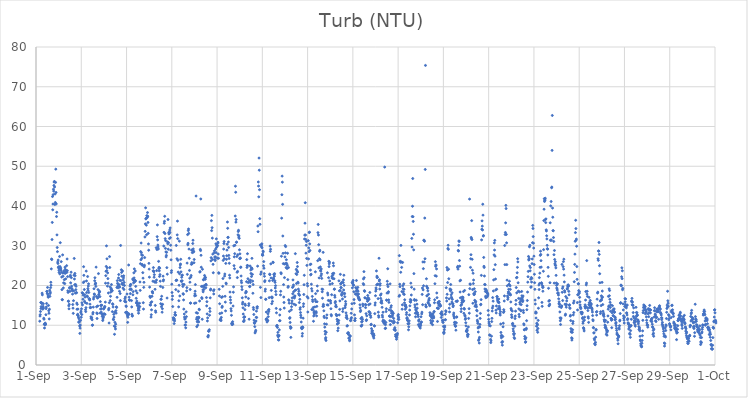
| Category | Turb (NTU) |
|---|---|
| 44440.166666666664 | 11.02 |
| 44440.177083333336 | 12.31 |
| 44440.1875 | 12.67 |
| 44440.197916666664 | 13.46 |
| 44440.208333333336 | 15.72 |
| 44440.21875 | 14.22 |
| 44440.229166666664 | 14.69 |
| 44440.239583333336 | 15.67 |
| 44440.25 | 15.5 |
| 44440.260416666664 | 15.59 |
| 44440.270833333336 | 18.06 |
| 44440.28125 | 17.65 |
| 44440.291666666664 | 14.39 |
| 44440.302083333336 | 14.05 |
| 44440.3125 | 14.75 |
| 44440.322916666664 | 15.4 |
| 44440.333333333336 | 14.33 |
| 44440.34375 | 11.76 |
| 44440.354166666664 | 11.52 |
| 44440.364583333336 | 10.25 |
| 44440.375 | 9.31 |
| 44440.385416666664 | 10.34 |
| 44440.395833333336 | 10.08 |
| 44440.40625 | 10.55 |
| 44440.416666666664 | 10.16 |
| 44440.427083333336 | 10.31 |
| 44440.4375 | 12.65 |
| 44440.447916666664 | 14.18 |
| 44440.458333333336 | 14.6 |
| 44440.46875 | 15.48 |
| 44440.479166666664 | 18.53 |
| 44440.489583333336 | 18.48 |
| 44440.5 | 18.03 |
| 44440.510416666664 | 19.52 |
| 44440.520833333336 | 17.82 |
| 44440.53125 | 17.36 |
| 44440.541666666664 | 17.05 |
| 44440.552083333336 | 14.99 |
| 44440.5625 | 13.65 |
| 44440.572916666664 | 13.01 |
| 44440.583333333336 | 11.59 |
| 44440.59375 | 14.04 |
| 44440.604166666664 | 18.81 |
| 44440.614583333336 | 17.27 |
| 44440.625 | 17.96 |
| 44440.635416666664 | 18.32 |
| 44440.645833333336 | 19.47 |
| 44440.65625 | 20.81 |
| 44440.666666666664 | 20.08 |
| 44440.677083333336 | 24.18 |
| 44440.6875 | 26.66 |
| 44440.697916666664 | 26.53 |
| 44440.708333333336 | 31.56 |
| 44440.71875 | 35.87 |
| 44440.729166666664 | 42.38 |
| 44440.739583333336 | 39.04 |
| 44440.75 | 40.49 |
| 44440.760416666664 | 42.86 |
| 44440.770833333336 | 44.22 |
| 44440.78125 | 43.75 |
| 44440.791666666664 | 45.17 |
| 44440.802083333336 | 46.01 |
| 44440.8125 | 46.17 |
| 44440.822916666664 | 44.79 |
| 44440.833333333336 | 40.37 |
| 44440.84375 | 43.02 |
| 44440.854166666664 | 40.89 |
| 44440.864583333336 | 45.94 |
| 44440.875 | 49.27 |
| 44440.885416666664 | 43.41 |
| 44440.895833333336 | 40.53 |
| 44440.90625 | 37.35 |
| 44440.916666666664 | 38.42 |
| 44440.927083333336 | 32.73 |
| 44440.9375 | 29.55 |
| 44440.947916666664 | 28.52 |
| 44440.958333333336 | 25.89 |
| 44440.96875 | 25.54 |
| 44440.979166666664 | 26.4 |
| 44440.989583333336 | 24.51 |
| 44441.0 | 24.71 |
| 44441.010416666664 | 23.85 |
| 44441.020833333336 | 23.3 |
| 44441.03125 | 24.33 |
| 44441.041666666664 | 27.3 |
| 44441.052083333336 | 22.92 |
| 44441.0625 | 24.76 |
| 44441.072916666664 | 30.77 |
| 44441.083333333336 | 24.45 |
| 44441.09375 | 24.19 |
| 44441.104166666664 | 23.85 |
| 44441.114583333336 | 26 |
| 44441.125 | 23.36 |
| 44441.135416666664 | 22.13 |
| 44441.145833333336 | 18.97 |
| 44441.15625 | 16.43 |
| 44441.166666666664 | 16.44 |
| 44441.177083333336 | 27.7 |
| 44441.1875 | 23.11 |
| 44441.197916666664 | 22.33 |
| 44441.208333333336 | 19.39 |
| 44441.21875 | 20.66 |
| 44441.229166666664 | 23.64 |
| 44441.239583333336 | 23.37 |
| 44441.25 | 21.47 |
| 44441.260416666664 | 23.13 |
| 44441.270833333336 | 20.48 |
| 44441.28125 | 24.62 |
| 44441.291666666664 | 24.08 |
| 44441.302083333336 | 23.08 |
| 44441.3125 | 21.67 |
| 44441.322916666664 | 23.81 |
| 44441.333333333336 | 23.59 |
| 44441.34375 | 23.65 |
| 44441.354166666664 | 24.99 |
| 44441.364583333336 | 23.3 |
| 44441.375 | 26.67 |
| 44441.385416666664 | 23.73 |
| 44441.395833333336 | 22.24 |
| 44441.40625 | 18.66 |
| 44441.416666666664 | 18.26 |
| 44441.427083333336 | 16.05 |
| 44441.4375 | 16.03 |
| 44441.447916666664 | 14.89 |
| 44441.458333333336 | 14.13 |
| 44441.46875 | 15.27 |
| 44441.479166666664 | 19.47 |
| 44441.489583333336 | 19.32 |
| 44441.5 | 18.52 |
| 44441.510416666664 | 22.25 |
| 44441.520833333336 | 22.56 |
| 44441.53125 | 20.67 |
| 44441.541666666664 | 618.38 |
| 44441.552083333336 | 23.35 |
| 44441.5625 | 21.97 |
| 44441.572916666664 | 19.82 |
| 44441.583333333336 | 19.25 |
| 44441.59375 | 19.03 |
| 44441.604166666664 | 18.67 |
| 44441.614583333336 | 17.83 |
| 44441.625 | 15.21 |
| 44441.635416666664 | 14.3 |
| 44441.645833333336 | 12.99 |
| 44441.65625 | 16.18 |
| 44441.666666666664 | 18.65 |
| 44441.677083333336 | 22.59 |
| 44441.6875 | 26.81 |
| 44441.697916666664 | 21.63 |
| 44441.708333333336 | 20.18 |
| 44441.71875 | 23.03 |
| 44441.729166666664 | 22.46 |
| 44441.739583333336 | 18.08 |
| 44441.75 | 20.25 |
| 44441.760416666664 | 18.96 |
| 44441.770833333336 | 19.81 |
| 44441.78125 | 18.18 |
| 44441.791666666664 | 18.2 |
| 44441.802083333336 | 15.57 |
| 44441.8125 | 14.03 |
| 44441.822916666664 | 15.25 |
| 44441.833333333336 | 12.59 |
| 44441.84375 | 12.76 |
| 44441.854166666664 | 14.07 |
| 44441.864583333336 | 12.42 |
| 44441.875 | 12.04 |
| 44441.885416666664 | 10.75 |
| 44441.895833333336 | 11.65 |
| 44441.90625 | 10.93 |
| 44441.916666666664 | 10.81 |
| 44441.927083333336 | 9.82 |
| 44441.9375 | 7.95 |
| 44441.947916666664 | 9.27 |
| 44441.958333333336 | 10.04 |
| 44441.96875 | 11.23 |
| 44441.979166666664 | 13.15 |
| 44441.989583333336 | 13.54 |
| 44442.0 | 12.02 |
| 44442.010416666664 | 14.13 |
| 44442.020833333336 | 12.7 |
| 44442.03125 | 15.64 |
| 44442.041666666664 | 18.18 |
| 44442.052083333336 | 15.12 |
| 44442.0625 | 18.08 |
| 44442.072916666664 | 16.55 |
| 44442.083333333336 | 17.56 |
| 44442.09375 | 20.74 |
| 44442.104166666664 | 24.73 |
| 44442.114583333336 | 22.56 |
| 44442.125 | 20.95 |
| 44442.135416666664 | 18.99 |
| 44442.145833333336 | 16.03 |
| 44442.15625 | 17.7 |
| 44442.166666666664 | 17.08 |
| 44442.177083333336 | 15.69 |
| 44442.1875 | 13.91 |
| 44442.197916666664 | 13.43 |
| 44442.208333333336 | 14.42 |
| 44442.21875 | 23.62 |
| 44442.229166666664 | 21.14 |
| 44442.239583333336 | 18.24 |
| 44442.25 | 15.5 |
| 44442.260416666664 | 17.35 |
| 44442.270833333336 | 17.22 |
| 44442.28125 | 22.26 |
| 44442.291666666664 | 19.23 |
| 44442.302083333336 | 18.79 |
| 44442.3125 | 19.86 |
| 44442.322916666664 | 20.42 |
| 44442.333333333336 | 18.25 |
| 44442.34375 | 16.62 |
| 44442.354166666664 | 16.71 |
| 44442.364583333336 | 16.56 |
| 44442.375 | 16.34 |
| 44442.385416666664 | 15.31 |
| 44442.395833333336 | 14.43 |
| 44442.40625 | 14.48 |
| 44442.416666666664 | 14.46 |
| 44442.427083333336 | 12.12 |
| 44442.4375 | 11.74 |
| 44442.447916666664 | 11.81 |
| 44442.458333333336 | 11.93 |
| 44442.46875 | 495.26 |
| 44442.479166666664 | 11.38 |
| 44442.489583333336 | 9.98 |
| 44442.5 | 10.06 |
| 44442.510416666664 | 12.84 |
| 44442.520833333336 | 13.21 |
| 44442.53125 | 14.56 |
| 44442.541666666664 | 16.6 |
| 44442.552083333336 | 17.07 |
| 44442.5625 | 19.18 |
| 44442.572916666664 | 17.87 |
| 44442.583333333336 | 17.74 |
| 44442.59375 | 21.19 |
| 44442.604166666664 | 21.96 |
| 44442.614583333336 | 20.32 |
| 44442.625 | 20.47 |
| 44442.635416666664 | 20.58 |
| 44442.645833333336 | 19.77 |
| 44442.65625 | 24.62 |
| 44442.666666666664 | 17.24 |
| 44442.677083333336 | 14.65 |
| 44442.6875 | 13.09 |
| 44442.697916666664 | 11.7 |
| 44442.708333333336 | 12.93 |
| 44442.71875 | 16.82 |
| 44442.729166666664 | 14.85 |
| 44442.739583333336 | 18.96 |
| 44442.75 | 17.09 |
| 44442.760416666664 | 22.99 |
| 44442.770833333336 | 17.63 |
| 44442.78125 | 17.81 |
| 44442.791666666664 | 18.36 |
| 44442.802083333336 | 18.56 |
| 44442.8125 | 18.41 |
| 44442.822916666664 | 17.21 |
| 44442.833333333336 | 13.07 |
| 44442.84375 | 15.95 |
| 44442.854166666664 | 14.09 |
| 44442.864583333336 | 14.96 |
| 44442.875 | 15.02 |
| 44442.885416666664 | 13.3 |
| 44442.895833333336 | 14.18 |
| 44442.90625 | 15.04 |
| 44442.916666666664 | 12.82 |
| 44442.927083333336 | 12.25 |
| 44442.9375 | 12.72 |
| 44442.947916666664 | 11.19 |
| 44442.958333333336 | 11.59 |
| 44442.96875 | 11.92 |
| 44442.979166666664 | 12.16 |
| 44442.989583333336 | 14.09 |
| 44443.0 | 12.73 |
| 44443.010416666664 | 12.91 |
| 44443.020833333336 | 14.35 |
| 44443.03125 | 14.55 |
| 44443.041666666664 | 14.72 |
| 44443.052083333336 | 12.74 |
| 44443.0625 | 15.82 |
| 44443.072916666664 | 20.58 |
| 44443.083333333336 | 22.47 |
| 44443.09375 | 23.57 |
| 44443.104166666664 | 24.8 |
| 44443.114583333336 | 29.97 |
| 44443.125 | 23.74 |
| 44443.135416666664 | 26.71 |
| 44443.145833333336 | 24.43 |
| 44443.15625 | 19.84 |
| 44443.166666666664 | 23.17 |
| 44443.177083333336 | 21.74 |
| 44443.1875 | 20.58 |
| 44443.197916666664 | 18.12 |
| 44443.208333333336 | 13.88 |
| 44443.21875 | 14.24 |
| 44443.229166666664 | 10.56 |
| 44443.239583333336 | 15.67 |
| 44443.25 | 27.27 |
| 44443.260416666664 | 24.52 |
| 44443.270833333336 | 19.64 |
| 44443.28125 | 16.21 |
| 44443.291666666664 | 17.28 |
| 44443.302083333336 | 18.33 |
| 44443.3125 | 19.05 |
| 44443.322916666664 | 19.29 |
| 44443.333333333336 | 20.24 |
| 44443.34375 | 18.72 |
| 44443.354166666664 | 18.77 |
| 44443.364583333336 | 18.64 |
| 44443.375 | 13.42 |
| 44443.385416666664 | 15.41 |
| 44443.395833333336 | 15.24 |
| 44443.40625 | 14.59 |
| 44443.416666666664 | 11.52 |
| 44443.427083333336 | 11.38 |
| 44443.4375 | 12.74 |
| 44443.447916666664 | 12.04 |
| 44443.458333333336 | 9.79 |
| 44443.46875 | 7.72 |
| 44443.479166666664 | 13.27 |
| 44443.489583333336 | 10.72 |
| 44443.5 | 9.61 |
| 44443.510416666664 | 9.07 |
| 44443.520833333336 | 10.27 |
| 44443.53125 | 13.67 |
| 44443.541666666664 | 13.06 |
| 44443.552083333336 | 14.63 |
| 44443.5625 | 14.47 |
| 44443.572916666664 | 19.52 |
| 44443.583333333336 | 17.03 |
| 44443.59375 | 21.22 |
| 44443.604166666664 | 20.55 |
| 44443.614583333336 | 19.82 |
| 44443.625 | 19.4 |
| 44443.635416666664 | 20.25 |
| 44443.645833333336 | 21.88 |
| 44443.65625 | 22.76 |
| 44443.666666666664 | 19.65 |
| 44443.677083333336 | 20.18 |
| 44443.6875 | 18.54 |
| 44443.697916666664 | 19.62 |
| 44443.708333333336 | 21.29 |
| 44443.71875 | 17.98 |
| 44443.729166666664 | 16.21 |
| 44443.739583333336 | 30.07 |
| 44443.75 | 21.25 |
| 44443.760416666664 | 437.46 |
| 44443.770833333336 | 23.96 |
| 44443.78125 | 23.29 |
| 44443.791666666664 | 22.34 |
| 44443.802083333336 | 20.43 |
| 44443.8125 | 20.57 |
| 44443.822916666664 | 23.65 |
| 44443.833333333336 | 20.23 |
| 44443.84375 | 19.36 |
| 44443.854166666664 | 21.36 |
| 44443.864583333336 | 21.91 |
| 44443.875 | 22.43 |
| 44443.885416666664 | 19.01 |
| 44443.895833333336 | 20.77 |
| 44443.90625 | 20.01 |
| 44443.916666666664 | 16.07 |
| 44443.927083333336 | 16.66 |
| 44443.9375 | 15.95 |
| 44443.947916666664 | 17.09 |
| 44443.958333333336 | 13.22 |
| 44443.96875 | 15.88 |
| 44443.979166666664 | 14.87 |
| 44443.989583333336 | 14.71 |
| 44444.0 | 13.25 |
| 44444.010416666664 | 13.27 |
| 44444.020833333336 | 17.85 |
| 44444.03125 | 12.71 |
| 44444.041666666664 | 12.35 |
| 44444.052083333336 | 10.73 |
| 44444.0625 | 12 |
| 44444.072916666664 | 12.75 |
| 44444.083333333336 | 12.96 |
| 44444.09375 | 25.15 |
| 44444.104166666664 | 12.72 |
| 44444.114583333336 | 17.05 |
| 44444.125 | 16.38 |
| 44444.135416666664 | 16.3 |
| 44444.145833333336 | 19.03 |
| 44444.15625 | 19.84 |
| 44444.166666666664 | 17.96 |
| 44444.177083333336 | 20.23 |
| 44444.1875 | 20.26 |
| 44444.197916666664 | 19.13 |
| 44444.208333333336 | 18.98 |
| 44444.21875 | 16.2 |
| 44444.229166666664 | 14.61 |
| 44444.239583333336 | 12.78 |
| 44444.25 | 12.31 |
| 44444.260416666664 | 12.37 |
| 44444.270833333336 | 21.62 |
| 44444.28125 | 17.66 |
| 44444.291666666664 | 18.46 |
| 44444.302083333336 | 21.31 |
| 44444.3125 | 20.66 |
| 44444.322916666664 | 23.18 |
| 44444.333333333336 | 21.91 |
| 44444.34375 | 24.18 |
| 44444.354166666664 | 21.04 |
| 44444.364583333336 | 21.32 |
| 44444.375 | 20.99 |
| 44444.385416666664 | 23.65 |
| 44444.395833333336 | 21.19 |
| 44444.40625 | 19.78 |
| 44444.416666666664 | 18.66 |
| 44444.427083333336 | 16.78 |
| 44444.4375 | 15.64 |
| 44444.447916666664 | 15.58 |
| 44444.458333333336 | 16.07 |
| 44444.46875 | 18.12 |
| 44444.479166666664 | 14.94 |
| 44444.489583333336 | 15.09 |
| 44444.5 | 15.5 |
| 44444.510416666664 | 13.75 |
| 44444.520833333336 | 14.32 |
| 44444.53125 | 13.04 |
| 44444.541666666664 | 14.24 |
| 44444.552083333336 | 13.77 |
| 44444.5625 | 14.7 |
| 44444.572916666664 | 15.52 |
| 44444.583333333336 | 14.69 |
| 44444.59375 | 20.88 |
| 44444.604166666664 | 18.77 |
| 44444.614583333336 | 25.49 |
| 44444.625 | 28.53 |
| 44444.635416666664 | 26.47 |
| 44444.645833333336 | 30.69 |
| 44444.65625 | 28.25 |
| 44444.666666666664 | 27.69 |
| 44444.677083333336 | 26.83 |
| 44444.6875 | 25.31 |
| 44444.697916666664 | 25.07 |
| 44444.708333333336 | 27.58 |
| 44444.71875 | 23.23 |
| 44444.729166666664 | 21.85 |
| 44444.739583333336 | 15.67 |
| 44444.75 | 14.07 |
| 44444.760416666664 | 19.53 |
| 44444.770833333336 | 20.8 |
| 44444.78125 | 24.71 |
| 44444.791666666664 | 25.1 |
| 44444.802083333336 | 27.03 |
| 44444.8125 | 32.21 |
| 44444.822916666664 | 33.62 |
| 44444.833333333336 | 35.5 |
| 44444.84375 | 39.54 |
| 44444.854166666664 | 36.75 |
| 44444.864583333336 | 36.86 |
| 44444.875 | 35.18 |
| 44444.885416666664 | 32.77 |
| 44444.895833333336 | 37.57 |
| 44444.90625 | 37.06 |
| 44444.916666666664 | 37.2 |
| 44444.927083333336 | 38.35 |
| 44444.9375 | 37.44 |
| 44444.947916666664 | 35.86 |
| 44444.958333333336 | 33.12 |
| 44444.96875 | 30.46 |
| 44444.979166666664 | 28.88 |
| 44444.989583333336 | 25.57 |
| 44445.0 | 24.12 |
| 44445.010416666664 | 22.1 |
| 44445.020833333336 | 19.59 |
| 44445.03125 | 17.28 |
| 44445.041666666664 | 15.12 |
| 44445.052083333336 | 16.99 |
| 44445.0625 | 15.07 |
| 44445.072916666664 | 15.66 |
| 44445.083333333336 | 12.05 |
| 44445.09375 | 12.65 |
| 44445.104166666664 | 13.88 |
| 44445.114583333336 | 15.9 |
| 44445.125 | 17.28 |
| 44445.135416666664 | 18.4 |
| 44445.145833333336 | 18.46 |
| 44445.15625 | 18.1 |
| 44445.166666666664 | 21.08 |
| 44445.177083333336 | 23.69 |
| 44445.1875 | 24.51 |
| 44445.197916666664 | 23.6 |
| 44445.208333333336 | 23.45 |
| 44445.21875 | 22.08 |
| 44445.229166666664 | 22.73 |
| 44445.239583333336 | 20.9 |
| 44445.25 | 20.93 |
| 44445.260416666664 | 19.05 |
| 44445.270833333336 | 14.99 |
| 44445.28125 | 13.62 |
| 44445.291666666664 | 13.27 |
| 44445.302083333336 | 20.78 |
| 44445.3125 | 29.51 |
| 44445.322916666664 | 21.37 |
| 44445.333333333336 | 23.75 |
| 44445.34375 | 29.05 |
| 44445.354166666664 | 32.29 |
| 44445.364583333336 | 35.24 |
| 44445.375 | 31.47 |
| 44445.385416666664 | 30.17 |
| 44445.395833333336 | 29.69 |
| 44445.40625 | 29.19 |
| 44445.416666666664 | 26.07 |
| 44445.427083333336 | 24.27 |
| 44445.4375 | 24.57 |
| 44445.447916666664 | 23.69 |
| 44445.458333333336 | 22.28 |
| 44445.46875 | 24.38 |
| 44445.479166666664 | 22.74 |
| 44445.489583333336 | 21.09 |
| 44445.5 | 19.78 |
| 44445.510416666664 | 15.42 |
| 44445.520833333336 | 16.55 |
| 44445.53125 | 16.52 |
| 44445.541666666664 | 14.66 |
| 44445.552083333336 | 17.29 |
| 44445.5625 | 15.17 |
| 44445.572916666664 | 13.28 |
| 44445.583333333336 | 14.16 |
| 44445.59375 | 15.27 |
| 44445.604166666664 | 19.51 |
| 44445.614583333336 | 22.35 |
| 44445.625 | 21.15 |
| 44445.635416666664 | 21.43 |
| 44445.645833333336 | 29.94 |
| 44445.65625 | 33.38 |
| 44445.666666666664 | 35.67 |
| 44445.677083333336 | 36.15 |
| 44445.6875 | 37.41 |
| 44445.697916666664 | 33.07 |
| 44445.708333333336 | 31.79 |
| 44445.71875 | 29.34 |
| 44445.729166666664 | 31.29 |
| 44445.739583333336 | 28.45 |
| 44445.75 | 27.2 |
| 44445.760416666664 | 27.58 |
| 44445.770833333336 | 28.35 |
| 44445.78125 | 24.49 |
| 44445.791666666664 | 16.85 |
| 44445.802083333336 | 22.85 |
| 44445.8125 | 30.95 |
| 44445.822916666664 | 30.5 |
| 44445.833333333336 | 36.6 |
| 44445.84375 | 29.13 |
| 44445.854166666664 | 30.78 |
| 44445.864583333336 | 33.36 |
| 44445.875 | 32.96 |
| 44445.885416666664 | 33.12 |
| 44445.895833333336 | 31.83 |
| 44445.90625 | 33.96 |
| 44445.916666666664 | 33.37 |
| 44445.927083333336 | 34.48 |
| 44445.9375 | 32.03 |
| 44445.947916666664 | 30.13 |
| 44445.958333333336 | 28.87 |
| 44445.96875 | 26.46 |
| 44445.979166666664 | 23.26 |
| 44445.989583333336 | 23.74 |
| 44446.0 | 20.32 |
| 44446.010416666664 | 18.23 |
| 44446.020833333336 | 16.5 |
| 44446.03125 | 17.35 |
| 44446.041666666664 | 14.7 |
| 44446.052083333336 | 214.89 |
| 44446.0625 | 11.87 |
| 44446.072916666664 | 11.34 |
| 44446.083333333336 | 11.8 |
| 44446.09375 | 11.55 |
| 44446.104166666664 | 10.42 |
| 44446.114583333336 | 11.56 |
| 44446.125 | 11.09 |
| 44446.135416666664 | 12.63 |
| 44446.145833333336 | 13.19 |
| 44446.15625 | 12.62 |
| 44446.166666666664 | 12.52 |
| 44446.177083333336 | 18.97 |
| 44446.1875 | 21.26 |
| 44446.197916666664 | 30.08 |
| 44446.208333333336 | 21.32 |
| 44446.21875 | 21.31 |
| 44446.229166666664 | 26.73 |
| 44446.239583333336 | 32.73 |
| 44446.25 | 36.2 |
| 44446.260416666664 | 31.79 |
| 44446.270833333336 | 26.33 |
| 44446.28125 | 23.37 |
| 44446.291666666664 | 18.53 |
| 44446.302083333336 | 14.62 |
| 44446.3125 | 16.17 |
| 44446.322916666664 | 20.06 |
| 44446.333333333336 | 31.16 |
| 44446.34375 | 22.95 |
| 44446.354166666664 | 17.37 |
| 44446.364583333336 | 24.52 |
| 44446.375 | 25.17 |
| 44446.385416666664 | 25.4 |
| 44446.395833333336 | 26.59 |
| 44446.40625 | 23.44 |
| 44446.416666666664 | 21.13 |
| 44446.427083333336 | 21.03 |
| 44446.4375 | 22.07 |
| 44446.447916666664 | 22.5 |
| 44446.458333333336 | 21.18 |
| 44446.46875 | 22.62 |
| 44446.479166666664 | 20.32 |
| 44446.489583333336 | 19.76 |
| 44446.5 | 17.94 |
| 44446.510416666664 | 17.79 |
| 44446.520833333336 | 16.37 |
| 44446.53125 | 14.06 |
| 44446.541666666664 | 20.27 |
| 44446.552083333336 | 12.83 |
| 44446.5625 | 12.06 |
| 44446.572916666664 | 11.55 |
| 44446.583333333336 | 10.05 |
| 44446.59375 | 11.64 |
| 44446.604166666664 | 10.07 |
| 44446.614583333336 | 9.35 |
| 44446.625 | 10.79 |
| 44446.635416666664 | 13.37 |
| 44446.645833333336 | 12.16 |
| 44446.65625 | 18.64 |
| 44446.666666666664 | 19.47 |
| 44446.677083333336 | 25.64 |
| 44446.6875 | 22.8 |
| 44446.697916666664 | 32.8 |
| 44446.708333333336 | 30.24 |
| 44446.71875 | 30.62 |
| 44446.729166666664 | 33.81 |
| 44446.739583333336 | 34.22 |
| 44446.75 | 33.11 |
| 44446.760416666664 | 29.16 |
| 44446.770833333336 | 26.85 |
| 44446.78125 | 23.79 |
| 44446.791666666664 | 21.84 |
| 44446.802083333336 | 20.83 |
| 44446.8125 | 19 |
| 44446.822916666664 | 15.56 |
| 44446.833333333336 | 15.58 |
| 44446.84375 | 22.14 |
| 44446.854166666664 | 22.52 |
| 44446.864583333336 | 25.32 |
| 44446.875 | 28.9 |
| 44446.885416666664 | 25.76 |
| 44446.895833333336 | 25.45 |
| 44446.90625 | 28.27 |
| 44446.916666666664 | 28.95 |
| 44446.927083333336 | 30.57 |
| 44446.9375 | 31.39 |
| 44446.947916666664 | 29.2 |
| 44446.958333333336 | 28.41 |
| 44446.96875 | 28.6 |
| 44446.979166666664 | 25.73 |
| 44446.989583333336 | 26.55 |
| 44447.0 | 15.52 |
| 44447.010416666664 | 17.4 |
| 44447.020833333336 | 17.88 |
| 44447.03125 | 18.56 |
| 44447.041666666664 | 20.23 |
| 44447.052083333336 | 17.47 |
| 44447.0625 | 15.61 |
| 44447.072916666664 | 42.51 |
| 44447.083333333336 | 13.16 |
| 44447.09375 | 11.54 |
| 44447.104166666664 | 9.63 |
| 44447.114583333336 | 11.97 |
| 44447.125 | 10.88 |
| 44447.135416666664 | 13.05 |
| 44447.145833333336 | 10.02 |
| 44447.15625 | 11.09 |
| 44447.166666666664 | 11.65 |
| 44447.177083333336 | 12 |
| 44447.1875 | 10.83 |
| 44447.197916666664 | 11.96 |
| 44447.208333333336 | 14.04 |
| 44447.21875 | 13.9 |
| 44447.229166666664 | 16.1 |
| 44447.239583333336 | 23.37 |
| 44447.25 | 23.5 |
| 44447.260416666664 | 29.09 |
| 44447.270833333336 | 28.78 |
| 44447.28125 | 41.77 |
| 44447.291666666664 | 27.6 |
| 44447.302083333336 | 24.6 |
| 44447.3125 | 19.77 |
| 44447.322916666664 | 16.95 |
| 44447.333333333336 | 16.72 |
| 44447.34375 | 11.51 |
| 44447.354166666664 | 24.08 |
| 44447.364583333336 | 19.78 |
| 44447.375 | 18.9 |
| 44447.385416666664 | 18.41 |
| 44447.395833333336 | 21.47 |
| 44447.40625 | 21.46 |
| 44447.416666666664 | 19 |
| 44447.427083333336 | 19.58 |
| 44447.4375 | 19.99 |
| 44447.447916666664 | 22.53 |
| 44447.458333333336 | 21.88 |
| 44447.46875 | 22.05 |
| 44447.479166666664 | 21.57 |
| 44447.489583333336 | 22 |
| 44447.5 | 19.43 |
| 44447.510416666664 | 20.3 |
| 44447.520833333336 | 20.1 |
| 44447.53125 | 16.96 |
| 44447.541666666664 | 14.87 |
| 44447.552083333336 | 15.93 |
| 44447.5625 | 12.85 |
| 44447.572916666664 | 11.08 |
| 44447.583333333336 | 11.85 |
| 44447.59375 | 7.16 |
| 44447.604166666664 | 7.05 |
| 44447.614583333336 | 7.44 |
| 44447.625 | 8.5 |
| 44447.635416666664 | 8.53 |
| 44447.645833333336 | 8.56 |
| 44447.65625 | 8.88 |
| 44447.666666666664 | 12.52 |
| 44447.677083333336 | 14.23 |
| 44447.6875 | 13.48 |
| 44447.697916666664 | 16.9 |
| 44447.708333333336 | 18.87 |
| 44447.71875 | 19.1 |
| 44447.729166666664 | 26.2 |
| 44447.739583333336 | 27 |
| 44447.75 | 36.31 |
| 44447.760416666664 | 33.81 |
| 44447.770833333336 | 37.64 |
| 44447.78125 | 34.55 |
| 44447.791666666664 | 31.92 |
| 44447.802083333336 | 26.55 |
| 44447.8125 | 27.9 |
| 44447.822916666664 | 25.32 |
| 44447.833333333336 | 23.21 |
| 44447.84375 | 18.66 |
| 44447.854166666664 | 17.87 |
| 44447.864583333336 | 18.93 |
| 44447.875 | 28.25 |
| 44447.885416666664 | 28.72 |
| 44447.895833333336 | 27.16 |
| 44447.90625 | 26.53 |
| 44447.916666666664 | 26.28 |
| 44447.927083333336 | 27.2 |
| 44447.9375 | 29.18 |
| 44447.947916666664 | 30.48 |
| 44447.958333333336 | 28.27 |
| 44447.96875 | 31.73 |
| 44447.979166666664 | 29.61 |
| 44447.989583333336 | 30.08 |
| 44448.0 | 30.04 |
| 44448.010416666664 | 26.88 |
| 44448.020833333336 | 29.99 |
| 44448.03125 | 30.6 |
| 44448.041666666664 | 30.87 |
| 44448.052083333336 | 27.91 |
| 44448.0625 | 26.84 |
| 44448.072916666664 | 23.2 |
| 44448.083333333336 | 23.08 |
| 44448.09375 | 19.04 |
| 44448.104166666664 | 17.37 |
| 44448.114583333336 | 15.41 |
| 44448.125 | 12.94 |
| 44448.135416666664 | 11.3 |
| 44448.145833333336 | 11.46 |
| 44448.15625 | 11.41 |
| 44448.166666666664 | 11.56 |
| 44448.177083333336 | 11.17 |
| 44448.1875 | 11.98 |
| 44448.197916666664 | 17.01 |
| 44448.208333333336 | 13.1 |
| 44448.21875 | 14.49 |
| 44448.229166666664 | 14.77 |
| 44448.239583333336 | 17.18 |
| 44448.25 | 19.78 |
| 44448.260416666664 | 21.75 |
| 44448.270833333336 | 26.31 |
| 44448.28125 | 27.41 |
| 44448.291666666664 | 29.16 |
| 44448.302083333336 | 30.56 |
| 44448.3125 | 31.06 |
| 44448.322916666664 | 26.75 |
| 44448.333333333336 | 22.37 |
| 44448.34375 | 22.89 |
| 44448.354166666664 | 17.29 |
| 44448.364583333336 | 15.82 |
| 44448.375 | 13.61 |
| 44448.385416666664 | 25.56 |
| 44448.395833333336 | 20.61 |
| 44448.40625 | 20.41 |
| 44448.416666666664 | 26.57 |
| 44448.427083333336 | 27.48 |
| 44448.4375 | 28.91 |
| 44448.447916666664 | 30.39 |
| 44448.458333333336 | 35.97 |
| 44448.46875 | 34.39 |
| 44448.479166666664 | 32.09 |
| 44448.489583333336 | 32.13 |
| 44448.5 | 30.95 |
| 44448.510416666664 | 29.57 |
| 44448.520833333336 | 27.57 |
| 44448.53125 | 26.8 |
| 44448.541666666664 | 25.59 |
| 44448.552083333336 | 22.59 |
| 44448.5625 | 21.9 |
| 44448.572916666664 | 18.35 |
| 44448.583333333336 | 17.08 |
| 44448.59375 | 16.37 |
| 44448.604166666664 | 15.63 |
| 44448.614583333336 | 14.17 |
| 44448.625 | 13.6 |
| 44448.635416666664 | 12.5 |
| 44448.645833333336 | 10.49 |
| 44448.65625 | 10.33 |
| 44448.666666666664 | 10.15 |
| 44448.677083333336 | 10.45 |
| 44448.6875 | 10.89 |
| 44448.697916666664 | 10.28 |
| 44448.708333333336 | 14.84 |
| 44448.71875 | 18.31 |
| 44448.729166666664 | 19.66 |
| 44448.739583333336 | 29.98 |
| 44448.75 | 25 |
| 44448.760416666664 | 27.21 |
| 44448.770833333336 | 24.23 |
| 44448.78125 | 28.01 |
| 44448.791666666664 | 30.12 |
| 44448.802083333336 | 37.48 |
| 44448.8125 | 44.98 |
| 44448.822916666664 | 43.46 |
| 44448.833333333336 | 35.94 |
| 44448.84375 | 36.59 |
| 44448.854166666664 | 30.85 |
| 44448.864583333336 | 30.92 |
| 44448.875 | 27.3 |
| 44448.885416666664 | 23.33 |
| 44448.895833333336 | 21.99 |
| 44448.90625 | 23.55 |
| 44448.916666666664 | 27.75 |
| 44448.927083333336 | 32.75 |
| 44448.9375 | 33.58 |
| 44448.947916666664 | 33.89 |
| 44448.958333333336 | 32.16 |
| 44448.96875 | 32.48 |
| 44448.979166666664 | 31.85 |
| 44448.989583333336 | 28.98 |
| 44449.0 | 26.77 |
| 44449.010416666664 | 27.96 |
| 44449.020833333336 | 26.93 |
| 44449.03125 | 26.83 |
| 44449.041666666664 | 24.55 |
| 44449.052083333336 | 24.64 |
| 44449.0625 | 22.39 |
| 44449.072916666664 | 21.18 |
| 44449.083333333336 | 20.7 |
| 44449.09375 | 19.7 |
| 44449.104166666664 | 18.98 |
| 44449.114583333336 | 16.9 |
| 44449.125 | 15.34 |
| 44449.135416666664 | 15.79 |
| 44449.145833333336 | 14.38 |
| 44449.15625 | 12.82 |
| 44449.166666666664 | 10.96 |
| 44449.177083333336 | 12 |
| 44449.1875 | 11 |
| 44449.197916666664 | 11.27 |
| 44449.208333333336 | 12.01 |
| 44449.21875 | 12.13 |
| 44449.229166666664 | 13.94 |
| 44449.239583333336 | 15.3 |
| 44449.25 | 15 |
| 44449.260416666664 | 18.13 |
| 44449.270833333336 | 17.12 |
| 44449.28125 | 18.52 |
| 44449.291666666664 | 18.34 |
| 44449.302083333336 | 20.96 |
| 44449.3125 | 26.51 |
| 44449.322916666664 | 24.55 |
| 44449.333333333336 | 25.03 |
| 44449.34375 | 28 |
| 44449.354166666664 | 25 |
| 44449.364583333336 | 21.7 |
| 44449.375 | 20.74 |
| 44449.385416666664 | 16.74 |
| 44449.395833333336 | 14.97 |
| 44449.40625 | 15.44 |
| 44449.416666666664 | 11.52 |
| 44449.427083333336 | 21.16 |
| 44449.4375 | 19.72 |
| 44449.447916666664 | 19.77 |
| 44449.458333333336 | 24.91 |
| 44449.46875 | 20.76 |
| 44449.479166666664 | 21.32 |
| 44449.489583333336 | 23.91 |
| 44449.5 | 23.02 |
| 44449.510416666664 | 24.4 |
| 44449.520833333336 | 22.26 |
| 44449.53125 | 24.4 |
| 44449.541666666664 | 26.83 |
| 44449.552083333336 | 24.16 |
| 44449.5625 | 22.8 |
| 44449.572916666664 | 21.1 |
| 44449.583333333336 | 18.05 |
| 44449.59375 | 20.25 |
| 44449.604166666664 | 14.46 |
| 44449.614583333336 | 13.96 |
| 44449.625 | 12.71 |
| 44449.635416666664 | 11.27 |
| 44449.645833333336 | 10.63 |
| 44449.65625 | 10.48 |
| 44449.666666666664 | 9.65 |
| 44449.677083333336 | 8.07 |
| 44449.6875 | 10.88 |
| 44449.697916666664 | 8.39 |
| 44449.708333333336 | 8.73 |
| 44449.71875 | 11.07 |
| 44449.729166666664 | 11.99 |
| 44449.739583333336 | 13.55 |
| 44449.75 | 11.95 |
| 44449.760416666664 | 14.57 |
| 44449.770833333336 | 14.27 |
| 44449.78125 | 14.66 |
| 44449.791666666664 | 24.87 |
| 44449.802083333336 | 34.96 |
| 44449.8125 | 33.53 |
| 44449.822916666664 | 46.04 |
| 44449.833333333336 | 45.02 |
| 44449.84375 | 42.3 |
| 44449.854166666664 | 52.07 |
| 44449.864583333336 | 49.01 |
| 44449.875 | 44.1 |
| 44449.885416666664 | 36.82 |
| 44449.895833333336 | 35.39 |
| 44449.90625 | 30.18 |
| 44449.916666666664 | 19.53 |
| 44449.927083333336 | 22.85 |
| 44449.9375 | 16.96 |
| 44449.947916666664 | 23.39 |
| 44449.958333333336 | 29.75 |
| 44449.96875 | 30.24 |
| 44449.979166666664 | 30.49 |
| 44449.989583333336 | 29.48 |
| 44450.0 | 27.66 |
| 44450.010416666664 | 27.9 |
| 44450.020833333336 | 27.61 |
| 44450.03125 | 28.66 |
| 44450.041666666664 | 28.46 |
| 44450.052083333336 | 24.97 |
| 44450.0625 | 26.01 |
| 44450.072916666664 | 24.34 |
| 44450.083333333336 | 22.99 |
| 44450.09375 | 22.31 |
| 44450.104166666664 | 20.96 |
| 44450.114583333336 | 21.22 |
| 44450.125 | 18.58 |
| 44450.135416666664 | 19.08 |
| 44450.145833333336 | 16.51 |
| 44450.15625 | 16.55 |
| 44450.166666666664 | 11.52 |
| 44450.177083333336 | 13.32 |
| 44450.1875 | 11.65 |
| 44450.197916666664 | 11.16 |
| 44450.208333333336 | 10.82 |
| 44450.21875 | 11.18 |
| 44450.229166666664 | 11.1 |
| 44450.239583333336 | 11.23 |
| 44450.25 | 12.87 |
| 44450.260416666664 | 12.15 |
| 44450.270833333336 | 13.8 |
| 44450.28125 | 13.43 |
| 44450.291666666664 | 13.96 |
| 44450.302083333336 | 16.95 |
| 44450.3125 | 21.17 |
| 44450.322916666664 | 22.85 |
| 44450.333333333336 | 22.73 |
| 44450.34375 | 29.91 |
| 44450.354166666664 | 28.6 |
| 44450.364583333336 | 29.12 |
| 44450.375 | 25.44 |
| 44450.385416666664 | 21.89 |
| 44450.395833333336 | 18.77 |
| 44450.40625 | 17.08 |
| 44450.416666666664 | 15.43 |
| 44450.427083333336 | 16.85 |
| 44450.4375 | 17.06 |
| 44450.447916666664 | 16 |
| 44450.458333333336 | 21.25 |
| 44450.46875 | 25.87 |
| 44450.479166666664 | 25.78 |
| 44450.489583333336 | 21.85 |
| 44450.5 | 21.65 |
| 44450.510416666664 | 22.84 |
| 44450.520833333336 | 22.7 |
| 44450.53125 | 22.32 |
| 44450.541666666664 | 22.98 |
| 44450.552083333336 | 21.2 |
| 44450.5625 | 20.78 |
| 44450.572916666664 | 19.37 |
| 44450.583333333336 | 19.96 |
| 44450.59375 | 18.51 |
| 44450.604166666664 | 17.71 |
| 44450.614583333336 | 14.24 |
| 44450.625 | 13.13 |
| 44450.635416666664 | 9.73 |
| 44450.645833333336 | 9.95 |
| 44450.65625 | 9.89 |
| 44450.666666666664 | 9.45 |
| 44450.677083333336 | 7.49 |
| 44450.6875 | 8.2 |
| 44450.697916666664 | 7.13 |
| 44450.708333333336 | 6.33 |
| 44450.71875 | 7.22 |
| 44450.729166666664 | 6.29 |
| 44450.739583333336 | 7.42 |
| 44450.75 | 8.83 |
| 44450.760416666664 | 11.14 |
| 44450.770833333336 | 12.58 |
| 44450.78125 | 11.14 |
| 44450.791666666664 | 13.98 |
| 44450.802083333336 | 17.63 |
| 44450.8125 | 18.54 |
| 44450.822916666664 | 23.21 |
| 44450.833333333336 | 22.96 |
| 44450.84375 | 27.36 |
| 44450.854166666664 | 36.94 |
| 44450.864583333336 | 42.84 |
| 44450.875 | 47.52 |
| 44450.885416666664 | 46 |
| 44450.895833333336 | 40.42 |
| 44450.90625 | 32.45 |
| 44450.916666666664 | 28.1 |
| 44450.927083333336 | 25.5 |
| 44450.9375 | 20.22 |
| 44450.947916666664 | 17.1 |
| 44450.958333333336 | 15.73 |
| 44450.96875 | 14.32 |
| 44450.979166666664 | 21.98 |
| 44450.989583333336 | 25.4 |
| 44451.0 | 27.2 |
| 44451.010416666664 | 30.05 |
| 44451.020833333336 | 28.21 |
| 44451.03125 | 29.78 |
| 44451.041666666664 | 25.59 |
| 44451.052083333336 | 24.51 |
| 44451.0625 | 26.48 |
| 44451.072916666664 | 25.55 |
| 44451.083333333336 | 24.47 |
| 44451.09375 | 24.29 |
| 44451.104166666664 | 25.11 |
| 44451.114583333336 | 28.11 |
| 44451.125 | 21.48 |
| 44451.135416666664 | 19.54 |
| 44451.145833333336 | 19.78 |
| 44451.15625 | 24.51 |
| 44451.166666666664 | 16.4 |
| 44451.177083333336 | 16.25 |
| 44451.1875 | 15.56 |
| 44451.197916666664 | 13.5 |
| 44451.208333333336 | 11.73 |
| 44451.21875 | 11.92 |
| 44451.229166666664 | 10.7 |
| 44451.239583333336 | 9.64 |
| 44451.25 | 9.22 |
| 44451.260416666664 | 6.95 |
| 44451.270833333336 | 9.4 |
| 44451.28125 | 13.88 |
| 44451.291666666664 | 14.67 |
| 44451.302083333336 | 15.52 |
| 44451.3125 | 16.12 |
| 44451.322916666664 | 16.9 |
| 44451.333333333336 | 19.52 |
| 44451.34375 | 17.92 |
| 44451.354166666664 | 21.4 |
| 44451.364583333336 | 19.7 |
| 44451.375 | 20.13 |
| 44451.385416666664 | 18.46 |
| 44451.395833333336 | 15.31 |
| 44451.40625 | 17.08 |
| 44451.416666666664 | 16.85 |
| 44451.427083333336 | 17.25 |
| 44451.4375 | 17.4 |
| 44451.447916666664 | 18.78 |
| 44451.458333333336 | 28.01 |
| 44451.46875 | 15.1 |
| 44451.479166666664 | 18.89 |
| 44451.489583333336 | 22.97 |
| 44451.5 | 24.06 |
| 44451.510416666664 | 20.51 |
| 44451.520833333336 | 22.77 |
| 44451.53125 | 23.7 |
| 44451.541666666664 | 25.78 |
| 44451.552083333336 | 24.77 |
| 44451.5625 | 23.39 |
| 44451.572916666664 | 20.84 |
| 44451.583333333336 | 20.61 |
| 44451.59375 | 19.09 |
| 44451.604166666664 | 17.93 |
| 44451.614583333336 | 18.55 |
| 44451.625 | 17.65 |
| 44451.635416666664 | 15.71 |
| 44451.645833333336 | 17.54 |
| 44451.65625 | 16.52 |
| 44451.666666666664 | 14 |
| 44451.677083333336 | 14.42 |
| 44451.6875 | 13.19 |
| 44451.697916666664 | 12.52 |
| 44451.708333333336 | 11.97 |
| 44451.71875 | 10.82 |
| 44451.729166666664 | 9.45 |
| 44451.739583333336 | 9.2 |
| 44451.75 | 9.11 |
| 44451.760416666664 | 7.27 |
| 44451.770833333336 | 7.93 |
| 44451.78125 | 9.59 |
| 44451.791666666664 | 9.4 |
| 44451.802083333336 | 11.78 |
| 44451.8125 | 14.73 |
| 44451.822916666664 | 15.4 |
| 44451.833333333336 | 17.74 |
| 44451.84375 | 20.2 |
| 44451.854166666664 | 22.57 |
| 44451.864583333336 | 31.69 |
| 44451.875 | 32.68 |
| 44451.885416666664 | 35.68 |
| 44451.895833333336 | 40.82 |
| 44451.90625 | 32.7 |
| 44451.916666666664 | 31.61 |
| 44451.927083333336 | 28.14 |
| 44451.9375 | 30.12 |
| 44451.947916666664 | 31.07 |
| 44451.958333333336 | 26.8 |
| 44451.96875 | 25.06 |
| 44451.979166666664 | 17.19 |
| 44451.989583333336 | 20.48 |
| 44452.0 | 19.89 |
| 44452.010416666664 | 13.33 |
| 44452.020833333336 | 16.84 |
| 44452.03125 | 31.28 |
| 44452.041666666664 | 26.69 |
| 44452.052083333336 | 29.47 |
| 44452.0625 | 28.52 |
| 44452.072916666664 | 33.32 |
| 44452.083333333336 | 33.42 |
| 44452.09375 | 30.47 |
| 44452.104166666664 | 28.81 |
| 44452.114583333336 | 25.27 |
| 44452.125 | 23.88 |
| 44452.135416666664 | 22.68 |
| 44452.145833333336 | 25.38 |
| 44452.15625 | 22.83 |
| 44452.166666666664 | 20.33 |
| 44452.177083333336 | 19.21 |
| 44452.1875 | 13.96 |
| 44452.197916666664 | 18.62 |
| 44452.208333333336 | 17.25 |
| 44452.21875 | 16.4 |
| 44452.229166666664 | 15.98 |
| 44452.239583333336 | 13.93 |
| 44452.25 | 14.46 |
| 44452.260416666664 | 11 |
| 44452.270833333336 | 12.33 |
| 44452.28125 | 13.12 |
| 44452.291666666664 | 13.41 |
| 44452.302083333336 | 12.79 |
| 44452.3125 | 13.37 |
| 44452.322916666664 | 14.61 |
| 44452.333333333336 | 16.46 |
| 44452.34375 | 23.44 |
| 44452.354166666664 | 17.95 |
| 44452.364583333336 | 15.95 |
| 44452.375 | 13.43 |
| 44452.385416666664 | 13.12 |
| 44452.395833333336 | 12.36 |
| 44452.40625 | 14.75 |
| 44452.416666666664 | 15.92 |
| 44452.427083333336 | 19.88 |
| 44452.4375 | 18.64 |
| 44452.447916666664 | 26.25 |
| 44452.458333333336 | 33.3 |
| 44452.46875 | 35.36 |
| 44452.479166666664 | 32.7 |
| 44452.489583333336 | 30.26 |
| 44452.5 | 24.43 |
| 44452.510416666664 | 21.91 |
| 44452.520833333336 | 26.73 |
| 44452.53125 | 28.61 |
| 44452.541666666664 | 28.88 |
| 44452.552083333336 | 26.46 |
| 44452.5625 | 24.68 |
| 44452.572916666664 | 23.8 |
| 44452.583333333336 | 23.61 |
| 44452.59375 | 22.46 |
| 44452.604166666664 | 24.17 |
| 44452.614583333336 | 22.92 |
| 44452.625 | 21.79 |
| 44452.635416666664 | 19.1 |
| 44452.645833333336 | 18.42 |
| 44452.65625 | 16.8 |
| 44452.666666666664 | 19.02 |
| 44452.677083333336 | 14.76 |
| 44452.6875 | 28.34 |
| 44452.697916666664 | 15.26 |
| 44452.708333333336 | 14.79 |
| 44452.71875 | 13.63 |
| 44452.729166666664 | 12.26 |
| 44452.739583333336 | 11.94 |
| 44452.75 | 10.35 |
| 44452.760416666664 | 9.52 |
| 44452.770833333336 | 8.48 |
| 44452.78125 | 7.76 |
| 44452.791666666664 | 6.56 |
| 44452.802083333336 | 6.9 |
| 44452.8125 | 6.17 |
| 44452.822916666664 | 8.24 |
| 44452.833333333336 | 10.28 |
| 44452.84375 | 11.83 |
| 44452.854166666664 | 12.6 |
| 44452.864583333336 | 15.13 |
| 44452.875 | 23.19 |
| 44452.885416666664 | 18.09 |
| 44452.895833333336 | 17.62 |
| 44452.90625 | 15.08 |
| 44452.916666666664 | 16.24 |
| 44452.927083333336 | 21.97 |
| 44452.9375 | 26.09 |
| 44452.947916666664 | 24.76 |
| 44452.958333333336 | 25.45 |
| 44452.96875 | 25.87 |
| 44452.979166666664 | 21.13 |
| 44452.989583333336 | 20.31 |
| 44453.0 | 16.21 |
| 44453.010416666664 | 16.11 |
| 44453.020833333336 | 15.58 |
| 44453.03125 | 14.15 |
| 44453.041666666664 | 12.67 |
| 44453.052083333336 | 12.38 |
| 44453.0625 | 17.68 |
| 44453.072916666664 | 22.32 |
| 44453.083333333336 | 21.87 |
| 44453.09375 | 20.49 |
| 44453.104166666664 | 22.98 |
| 44453.114583333336 | 21.78 |
| 44453.125 | 22.67 |
| 44453.135416666664 | 25.65 |
| 44453.145833333336 | 24.95 |
| 44453.15625 | 23.08 |
| 44453.166666666664 | 21.69 |
| 44453.177083333336 | 19.08 |
| 44453.1875 | 19.07 |
| 44453.197916666664 | 17.51 |
| 44453.208333333336 | 17.05 |
| 44453.21875 | 15.66 |
| 44453.229166666664 | 15.98 |
| 44453.239583333336 | 14.71 |
| 44453.25 | 15.08 |
| 44453.260416666664 | 12.74 |
| 44453.270833333336 | 14.65 |
| 44453.28125 | 12.41 |
| 44453.291666666664 | 12.5 |
| 44453.302083333336 | 11.5 |
| 44453.3125 | 10.3 |
| 44453.322916666664 | 10.97 |
| 44453.333333333336 | 8.63 |
| 44453.34375 | 11.21 |
| 44453.354166666664 | 9.28 |
| 44453.364583333336 | 10.55 |
| 44453.375 | 11.18 |
| 44453.385416666664 | 21.17 |
| 44453.395833333336 | 12.6 |
| 44453.40625 | 18.66 |
| 44453.416666666664 | 14 |
| 44453.427083333336 | 16.13 |
| 44453.4375 | 18.74 |
| 44453.447916666664 | 22.81 |
| 44453.458333333336 | 20.41 |
| 44453.46875 | 19.52 |
| 44453.479166666664 | 20.52 |
| 44453.489583333336 | 19.42 |
| 44453.5 | 17.82 |
| 44453.510416666664 | 17.53 |
| 44453.520833333336 | 20.84 |
| 44453.53125 | 18.27 |
| 44453.541666666664 | 16.61 |
| 44453.552083333336 | 13.45 |
| 44453.5625 | 14.16 |
| 44453.572916666664 | 20.73 |
| 44453.583333333336 | 21.4 |
| 44453.59375 | 18.88 |
| 44453.604166666664 | 22.59 |
| 44453.614583333336 | 20.05 |
| 44453.625 | 17.89 |
| 44453.635416666664 | 18.02 |
| 44453.645833333336 | 17.17 |
| 44453.65625 | 14.42 |
| 44453.666666666664 | 14.91 |
| 44453.677083333336 | 15.99 |
| 44453.6875 | 15.36 |
| 44453.697916666664 | 13.12 |
| 44453.708333333336 | 11.92 |
| 44453.71875 | 12.49 |
| 44453.729166666664 | 12.05 |
| 44453.739583333336 | 9.8 |
| 44453.75 | 11.62 |
| 44453.760416666664 | 9.9 |
| 44453.770833333336 | 8 |
| 44453.78125 | 8.01 |
| 44453.791666666664 | 7.98 |
| 44453.802083333336 | 8.14 |
| 44453.8125 | 7.66 |
| 44453.822916666664 | 6.77 |
| 44453.833333333336 | 6.71 |
| 44453.84375 | 6.85 |
| 44453.854166666664 | 6.1 |
| 44453.864583333336 | 6.29 |
| 44453.875 | 7.35 |
| 44453.885416666664 | 7.25 |
| 44453.895833333336 | 11.15 |
| 44453.90625 | 11.21 |
| 44453.916666666664 | 11.61 |
| 44453.927083333336 | 13.01 |
| 44453.9375 | 11.92 |
| 44453.947916666664 | 14.1 |
| 44453.958333333336 | 15.42 |
| 44453.96875 | 20.77 |
| 44453.979166666664 | 19.42 |
| 44453.989583333336 | 20.47 |
| 44454.0 | 20.87 |
| 44454.010416666664 | 21.27 |
| 44454.020833333336 | 20.15 |
| 44454.03125 | 20.04 |
| 44454.041666666664 | 18.42 |
| 44454.052083333336 | 16.46 |
| 44454.0625 | 15.53 |
| 44454.072916666664 | 12.61 |
| 44454.083333333336 | 11.24 |
| 44454.09375 | 11.15 |
| 44454.104166666664 | 11.72 |
| 44454.114583333336 | 17.82 |
| 44454.125 | 19.46 |
| 44454.135416666664 | 17.9 |
| 44454.145833333336 | 18.61 |
| 44454.15625 | 21.26 |
| 44454.166666666664 | 19.37 |
| 44454.177083333336 | 19.1 |
| 44454.1875 | 17.96 |
| 44454.197916666664 | 18.79 |
| 44454.208333333336 | 17.41 |
| 44454.21875 | 19.53 |
| 44454.229166666664 | 18.56 |
| 44454.239583333336 | 16.87 |
| 44454.25 | 17.85 |
| 44454.260416666664 | 17.05 |
| 44454.270833333336 | 16.61 |
| 44454.28125 | 16.47 |
| 44454.291666666664 | 16.5 |
| 44454.302083333336 | 16.36 |
| 44454.3125 | 15.15 |
| 44454.322916666664 | 14.38 |
| 44454.333333333336 | 13.45 |
| 44454.34375 | 13.75 |
| 44454.354166666664 | 11.69 |
| 44454.364583333336 | 9.85 |
| 44454.375 | 9.78 |
| 44454.385416666664 | 10.84 |
| 44454.395833333336 | 11.97 |
| 44454.40625 | 10.07 |
| 44454.416666666664 | 11 |
| 44454.427083333336 | 11.5 |
| 44454.4375 | 15.32 |
| 44454.447916666664 | 14.86 |
| 44454.458333333336 | 20.47 |
| 44454.46875 | 21.66 |
| 44454.479166666664 | 20.22 |
| 44454.489583333336 | 23.49 |
| 44454.5 | 21.97 |
| 44454.510416666664 | 18.71 |
| 44454.520833333336 | 18.52 |
| 44454.53125 | 16.92 |
| 44454.541666666664 | 16.87 |
| 44454.552083333336 | 15.23 |
| 44454.5625 | 14.44 |
| 44454.572916666664 | 15.14 |
| 44454.583333333336 | 12.92 |
| 44454.59375 | 11.17 |
| 44454.604166666664 | 11.37 |
| 44454.614583333336 | 12.37 |
| 44454.625 | 16.65 |
| 44454.635416666664 | 16.66 |
| 44454.645833333336 | 16.03 |
| 44454.65625 | 17.49 |
| 44454.666666666664 | 16.32 |
| 44454.677083333336 | 16.5 |
| 44454.6875 | 16.87 |
| 44454.697916666664 | 15.15 |
| 44454.708333333336 | 13.38 |
| 44454.71875 | 16.55 |
| 44454.729166666664 | 13.38 |
| 44454.739583333336 | 12.69 |
| 44454.75 | 18.24 |
| 44454.760416666664 | 15.37 |
| 44454.770833333336 | 13.04 |
| 44454.78125 | 12.41 |
| 44454.791666666664 | 11.99 |
| 44454.802083333336 | 10.13 |
| 44454.8125 | 10.25 |
| 44454.822916666664 | 9.16 |
| 44454.833333333336 | 7.97 |
| 44454.84375 | 8.34 |
| 44454.854166666664 | 8.65 |
| 44454.864583333336 | 8.59 |
| 44454.875 | 7.9 |
| 44454.885416666664 | 7.61 |
| 44454.895833333336 | 7.35 |
| 44454.90625 | 7.12 |
| 44454.916666666664 | 7.85 |
| 44454.927083333336 | 6.77 |
| 44454.9375 | 7.48 |
| 44454.947916666664 | 9.89 |
| 44454.958333333336 | 9.8 |
| 44454.96875 | 12.92 |
| 44454.979166666664 | 15.08 |
| 44454.989583333336 | 15.63 |
| 44455.0 | 17.44 |
| 44455.010416666664 | 18.58 |
| 44455.020833333336 | 19.39 |
| 44455.03125 | 19.04 |
| 44455.041666666664 | 23.66 |
| 44455.052083333336 | 20.17 |
| 44455.0625 | 22.34 |
| 44455.072916666664 | 22 |
| 44455.083333333336 | 22.06 |
| 44455.09375 | 20.29 |
| 44455.104166666664 | 20.35 |
| 44455.114583333336 | 16.7 |
| 44455.125 | 13.29 |
| 44455.135416666664 | 12.41 |
| 44455.145833333336 | 12.03 |
| 44455.15625 | 26.86 |
| 44455.166666666664 | 21.14 |
| 44455.177083333336 | 21.43 |
| 44455.1875 | 19.12 |
| 44455.197916666664 | 20.04 |
| 44455.208333333336 | 20.45 |
| 44455.21875 | 17.57 |
| 44455.229166666664 | 16.77 |
| 44455.239583333336 | 15.72 |
| 44455.25 | 17.88 |
| 44455.260416666664 | 15.98 |
| 44455.270833333336 | 16.2 |
| 44455.28125 | 15.54 |
| 44455.291666666664 | 14.51 |
| 44455.302083333336 | 12.52 |
| 44455.3125 | 12.06 |
| 44455.322916666664 | 11.03 |
| 44455.333333333336 | 13.28 |
| 44455.34375 | 11.27 |
| 44455.354166666664 | 10.95 |
| 44455.364583333336 | 10.81 |
| 44455.375 | 10.6 |
| 44455.385416666664 | 10.44 |
| 44455.395833333336 | 11.08 |
| 44455.40625 | 49.79 |
| 44455.416666666664 | 10.58 |
| 44455.427083333336 | 9.19 |
| 44455.4375 | 10.13 |
| 44455.447916666664 | 9.24 |
| 44455.458333333336 | 10.7 |
| 44455.46875 | 13.46 |
| 44455.479166666664 | 14.16 |
| 44455.489583333336 | 16.34 |
| 44455.5 | 16.27 |
| 44455.510416666664 | 18.09 |
| 44455.520833333336 | 21.06 |
| 44455.53125 | 20.26 |
| 44455.541666666664 | 24.21 |
| 44455.552083333336 | 19.72 |
| 44455.5625 | 18.15 |
| 44455.572916666664 | 18.44 |
| 44455.583333333336 | 16.38 |
| 44455.59375 | 15.75 |
| 44455.604166666664 | 13.87 |
| 44455.614583333336 | 12.29 |
| 44455.625 | 12.32 |
| 44455.635416666664 | 11.14 |
| 44455.645833333336 | 20.41 |
| 44455.65625 | 10.16 |
| 44455.666666666664 | 12.17 |
| 44455.677083333336 | 14.48 |
| 44455.6875 | 13.7 |
| 44455.697916666664 | 14.9 |
| 44455.708333333336 | 13.05 |
| 44455.71875 | 11.02 |
| 44455.729166666664 | 13.49 |
| 44455.739583333336 | 12.17 |
| 44455.75 | 12.53 |
| 44455.760416666664 | 13.22 |
| 44455.770833333336 | 13.03 |
| 44455.78125 | 12.94 |
| 44455.791666666664 | 10.58 |
| 44455.802083333336 | 11.71 |
| 44455.8125 | 10.98 |
| 44455.822916666664 | 8.93 |
| 44455.833333333336 | 10.76 |
| 44455.84375 | 8.92 |
| 44455.854166666664 | 9.4 |
| 44455.864583333336 | 8.97 |
| 44455.875 | 8.67 |
| 44455.885416666664 | 7.63 |
| 44455.895833333336 | 7.21 |
| 44455.90625 | 7.29 |
| 44455.916666666664 | 7.17 |
| 44455.927083333336 | 6.48 |
| 44455.9375 | 6.9 |
| 44455.947916666664 | 7.45 |
| 44455.958333333336 | 7.68 |
| 44455.96875 | 7.95 |
| 44455.979166666664 | 10.63 |
| 44455.989583333336 | 12.35 |
| 44456.0 | 11.52 |
| 44456.010416666664 | 12.69 |
| 44456.020833333336 | 12.02 |
| 44456.03125 | 11.46 |
| 44456.041666666664 | 17.28 |
| 44456.052083333336 | 27.52 |
| 44456.0625 | 17.52 |
| 44456.072916666664 | 20.31 |
| 44456.083333333336 | 19.71 |
| 44456.09375 | 26.08 |
| 44456.104166666664 | 25.85 |
| 44456.114583333336 | 23.33 |
| 44456.125 | 30.09 |
| 44456.135416666664 | 88.36 |
| 44456.145833333336 | 25.91 |
| 44456.15625 | 24.55 |
| 44456.166666666664 | 18.47 |
| 44456.177083333336 | 14.04 |
| 44456.1875 | 15.14 |
| 44456.197916666664 | 25.8 |
| 44456.208333333336 | 19.97 |
| 44456.21875 | 19.19 |
| 44456.229166666664 | 18.42 |
| 44456.239583333336 | 17.88 |
| 44456.25 | 20.42 |
| 44456.260416666664 | 19.04 |
| 44456.270833333336 | 17.76 |
| 44456.28125 | 15.63 |
| 44456.291666666664 | 16.41 |
| 44456.302083333336 | 14.98 |
| 44456.3125 | 14.01 |
| 44456.322916666664 | 14.82 |
| 44456.333333333336 | 15.08 |
| 44456.34375 | 14.7 |
| 44456.354166666664 | 14.42 |
| 44456.364583333336 | 12.7 |
| 44456.375 | 13.19 |
| 44456.385416666664 | 11.7 |
| 44456.395833333336 | 11.93 |
| 44456.40625 | 11.62 |
| 44456.416666666664 | 11.23 |
| 44456.427083333336 | 11.15 |
| 44456.4375 | 10.37 |
| 44456.447916666664 | 10.38 |
| 44456.458333333336 | 8.85 |
| 44456.46875 | 9.61 |
| 44456.479166666664 | 10.45 |
| 44456.489583333336 | 11.1 |
| 44456.5 | 12.58 |
| 44456.510416666664 | 13.81 |
| 44456.520833333336 | 14.88 |
| 44456.53125 | 15.93 |
| 44456.541666666664 | 16.48 |
| 44456.552083333336 | 15.8 |
| 44456.5625 | 20.59 |
| 44456.572916666664 | 16.28 |
| 44456.583333333336 | 17.61 |
| 44456.59375 | 19.55 |
| 44456.604166666664 | 31.85 |
| 44456.614583333336 | 29.69 |
| 44456.625 | 37.35 |
| 44456.635416666664 | 39.94 |
| 44456.645833333336 | 46.91 |
| 44456.65625 | 37.31 |
| 44456.666666666664 | 36.12 |
| 44456.677083333336 | 32.89 |
| 44456.6875 | 28.96 |
| 44456.697916666664 | 22.99 |
| 44456.708333333336 | 19.08 |
| 44456.71875 | 16.48 |
| 44456.729166666664 | 16.26 |
| 44456.739583333336 | 15.12 |
| 44456.75 | 14.53 |
| 44456.760416666664 | 13.02 |
| 44456.770833333336 | 12.13 |
| 44456.78125 | 14.01 |
| 44456.791666666664 | 13.71 |
| 44456.802083333336 | 16.29 |
| 44456.8125 | 13.19 |
| 44456.822916666664 | 13.22 |
| 44456.833333333336 | 15.3 |
| 44456.84375 | 14.29 |
| 44456.854166666664 | 13.17 |
| 44456.864583333336 | 12.74 |
| 44456.875 | 12.61 |
| 44456.885416666664 | 12.18 |
| 44456.895833333336 | 10.16 |
| 44456.90625 | 11.2 |
| 44456.916666666664 | 11 |
| 44456.927083333336 | 11.4 |
| 44456.9375 | 9.69 |
| 44456.947916666664 | 9.96 |
| 44456.958333333336 | 9.62 |
| 44456.96875 | 9.77 |
| 44456.979166666664 | 9.3 |
| 44456.989583333336 | 10.41 |
| 44457.0 | 10.03 |
| 44457.010416666664 | 12.12 |
| 44457.020833333336 | 10.7 |
| 44457.03125 | 10.85 |
| 44457.041666666664 | 12.86 |
| 44457.052083333336 | 13.29 |
| 44457.0625 | 17.76 |
| 44457.072916666664 | 19.37 |
| 44457.083333333336 | 15.17 |
| 44457.09375 | 25.92 |
| 44457.104166666664 | 18.91 |
| 44457.114583333336 | 24.24 |
| 44457.125 | 19.94 |
| 44457.135416666664 | 31.38 |
| 44457.145833333336 | 31.4 |
| 44457.15625 | 25.93 |
| 44457.166666666664 | 31.12 |
| 44457.177083333336 | 36.97 |
| 44457.1875 | 26.74 |
| 44457.197916666664 | 49.2 |
| 44457.208333333336 | 75.37 |
| 44457.21875 | 15.14 |
| 44457.229166666664 | 14.73 |
| 44457.239583333336 | 14.61 |
| 44457.25 | 21.69 |
| 44457.260416666664 | 19.82 |
| 44457.270833333336 | 17.38 |
| 44457.28125 | 17.44 |
| 44457.291666666664 | 19.48 |
| 44457.302083333336 | 19.26 |
| 44457.3125 | 18.65 |
| 44457.322916666664 | 15.76 |
| 44457.333333333336 | 15.57 |
| 44457.34375 | 17.79 |
| 44457.354166666664 | 16.34 |
| 44457.364583333336 | 16.29 |
| 44457.375 | 16.77 |
| 44457.385416666664 | 15.19 |
| 44457.395833333336 | 14.91 |
| 44457.40625 | 13.16 |
| 44457.416666666664 | 12.55 |
| 44457.427083333336 | 12.35 |
| 44457.4375 | 11.19 |
| 44457.447916666664 | 12.57 |
| 44457.458333333336 | 10.53 |
| 44457.46875 | 10.65 |
| 44457.479166666664 | 11.93 |
| 44457.489583333336 | 12.38 |
| 44457.5 | 12.84 |
| 44457.510416666664 | 11.75 |
| 44457.520833333336 | 10.14 |
| 44457.53125 | 11.05 |
| 44457.541666666664 | 12.87 |
| 44457.552083333336 | 12.08 |
| 44457.5625 | 12.28 |
| 44457.572916666664 | 11.86 |
| 44457.583333333336 | 13.37 |
| 44457.59375 | 13.46 |
| 44457.604166666664 | 15.67 |
| 44457.614583333336 | 16.41 |
| 44457.625 | 20.45 |
| 44457.635416666664 | 22.47 |
| 44457.645833333336 | 26 |
| 44457.65625 | 24.81 |
| 44457.666666666664 | 25.17 |
| 44457.677083333336 | 25.1 |
| 44457.6875 | 22.35 |
| 44457.697916666664 | 24.17 |
| 44457.708333333336 | 18.12 |
| 44457.71875 | 16.94 |
| 44457.729166666664 | 14.31 |
| 44457.739583333336 | 10.96 |
| 44457.75 | 14.3 |
| 44457.760416666664 | 15.69 |
| 44457.770833333336 | 15.54 |
| 44457.78125 | 14.22 |
| 44457.791666666664 | 15.91 |
| 44457.802083333336 | 15.02 |
| 44457.8125 | 15.16 |
| 44457.822916666664 | 15.97 |
| 44457.833333333336 | 15.31 |
| 44457.84375 | 14.79 |
| 44457.854166666664 | 15.18 |
| 44457.864583333336 | 14.83 |
| 44457.875 | 14.92 |
| 44457.885416666664 | 12.94 |
| 44457.895833333336 | 13.01 |
| 44457.90625 | 11.96 |
| 44457.916666666664 | 12.98 |
| 44457.927083333336 | 13.41 |
| 44457.9375 | 12.51 |
| 44457.947916666664 | 12.72 |
| 44457.958333333336 | 11.25 |
| 44457.96875 | 10.84 |
| 44457.979166666664 | 11.23 |
| 44457.989583333336 | 10.7 |
| 44458.0 | 9.69 |
| 44458.010416666664 | 8.19 |
| 44458.020833333336 | 7.93 |
| 44458.03125 | 8.22 |
| 44458.041666666664 | 8.86 |
| 44458.052083333336 | 9.45 |
| 44458.0625 | 9.8 |
| 44458.072916666664 | 11.35 |
| 44458.083333333336 | 12.79 |
| 44458.09375 | 11.4 |
| 44458.104166666664 | 13.65 |
| 44458.114583333336 | 13.39 |
| 44458.125 | 19.44 |
| 44458.135416666664 | 16.88 |
| 44458.145833333336 | 16.09 |
| 44458.15625 | 24.51 |
| 44458.166666666664 | 17.79 |
| 44458.177083333336 | 23.89 |
| 44458.1875 | 20.74 |
| 44458.197916666664 | 29.31 |
| 44458.208333333336 | 30.12 |
| 44458.21875 | 29.09 |
| 44458.229166666664 | 24.09 |
| 44458.239583333336 | 21.7 |
| 44458.25 | 16.64 |
| 44458.260416666664 | 14.3 |
| 44458.270833333336 | 13.35 |
| 44458.28125 | 15.28 |
| 44458.291666666664 | 19.14 |
| 44458.302083333336 | 19 |
| 44458.3125 | 18.65 |
| 44458.322916666664 | 20.25 |
| 44458.333333333336 | 18.92 |
| 44458.34375 | 17.67 |
| 44458.354166666664 | 17.06 |
| 44458.364583333336 | 16.81 |
| 44458.375 | 15.84 |
| 44458.385416666664 | 18.16 |
| 44458.395833333336 | 16.53 |
| 44458.40625 | 15.41 |
| 44458.416666666664 | 15.43 |
| 44458.427083333336 | 14.67 |
| 44458.4375 | 14.97 |
| 44458.447916666664 | 12.61 |
| 44458.458333333336 | 13.07 |
| 44458.46875 | 12.2 |
| 44458.479166666664 | 11.83 |
| 44458.489583333336 | 10.66 |
| 44458.5 | 10.18 |
| 44458.510416666664 | 10.79 |
| 44458.520833333336 | 9.83 |
| 44458.53125 | 9.75 |
| 44458.541666666664 | 9.75 |
| 44458.552083333336 | 8.76 |
| 44458.5625 | 16.01 |
| 44458.572916666664 | 10.61 |
| 44458.583333333336 | 12.06 |
| 44458.59375 | 12.08 |
| 44458.604166666664 | 16 |
| 44458.614583333336 | 16.14 |
| 44458.625 | 24.55 |
| 44458.635416666664 | 24.82 |
| 44458.645833333336 | 24.12 |
| 44458.65625 | 28.82 |
| 44458.666666666664 | 28.68 |
| 44458.677083333336 | 30.11 |
| 44458.6875 | 31.22 |
| 44458.697916666664 | 31.07 |
| 44458.708333333336 | 26.29 |
| 44458.71875 | 24.86 |
| 44458.729166666664 | 21.16 |
| 44458.739583333336 | 18.37 |
| 44458.75 | 16.91 |
| 44458.760416666664 | 21.32 |
| 44458.770833333336 | 14.98 |
| 44458.78125 | 13.43 |
| 44458.791666666664 | 14.14 |
| 44458.802083333336 | 15.19 |
| 44458.8125 | 15.66 |
| 44458.822916666664 | 16.23 |
| 44458.833333333336 | 17.09 |
| 44458.84375 | 16.55 |
| 44458.854166666664 | 16.72 |
| 44458.864583333336 | 17.03 |
| 44458.875 | 15.92 |
| 44458.885416666664 | 18.48 |
| 44458.895833333336 | 16.18 |
| 44458.90625 | 13 |
| 44458.916666666664 | 14.23 |
| 44458.927083333336 | 14.05 |
| 44458.9375 | 18.75 |
| 44458.947916666664 | 12.51 |
| 44458.958333333336 | 12.3 |
| 44458.96875 | 11.47 |
| 44458.979166666664 | 11.74 |
| 44458.989583333336 | 10.63 |
| 44459.0 | 9.84 |
| 44459.010416666664 | 8.52 |
| 44459.020833333336 | 8.57 |
| 44459.03125 | 8.37 |
| 44459.041666666664 | 9 |
| 44459.052083333336 | 8.66 |
| 44459.0625 | 7.53 |
| 44459.072916666664 | 7.14 |
| 44459.083333333336 | 7.76 |
| 44459.09375 | 7.61 |
| 44459.104166666664 | 9.57 |
| 44459.114583333336 | 11.72 |
| 44459.125 | 17.69 |
| 44459.135416666664 | 14.17 |
| 44459.145833333336 | 13.03 |
| 44459.15625 | 41.74 |
| 44459.166666666664 | 19.21 |
| 44459.177083333336 | 20.41 |
| 44459.1875 | 20.27 |
| 44459.197916666664 | 24.56 |
| 44459.208333333336 | 26.72 |
| 44459.21875 | 27.75 |
| 44459.229166666664 | 32.1 |
| 44459.239583333336 | 31.8 |
| 44459.25 | 36.32 |
| 44459.260416666664 | 31.56 |
| 44459.270833333336 | 26.59 |
| 44459.28125 | 23.84 |
| 44459.291666666664 | 18.98 |
| 44459.302083333336 | 15.53 |
| 44459.3125 | 23.08 |
| 44459.322916666664 | 20.49 |
| 44459.333333333336 | 21.37 |
| 44459.34375 | 17.97 |
| 44459.354166666664 | 17.7 |
| 44459.364583333336 | 19.18 |
| 44459.375 | 17.85 |
| 44459.385416666664 | 16.27 |
| 44459.395833333336 | 14.79 |
| 44459.40625 | 18.44 |
| 44459.416666666664 | 15.78 |
| 44459.427083333336 | 16 |
| 44459.4375 | 15.2 |
| 44459.447916666664 | 14.86 |
| 44459.458333333336 | 14.62 |
| 44459.46875 | 13.76 |
| 44459.479166666664 | 12.39 |
| 44459.489583333336 | 13.61 |
| 44459.5 | 11.26 |
| 44459.510416666664 | 10.89 |
| 44459.520833333336 | 10.47 |
| 44459.53125 | 9.32 |
| 44459.541666666664 | 8.3 |
| 44459.552083333336 | 6.19 |
| 44459.5625 | 9.59 |
| 44459.572916666664 | 6.47 |
| 44459.583333333336 | 5.53 |
| 44459.59375 | 6.95 |
| 44459.604166666664 | 9.54 |
| 44459.614583333336 | 10.21 |
| 44459.625 | 11.72 |
| 44459.635416666664 | 12.98 |
| 44459.645833333336 | 15.16 |
| 44459.65625 | 15.29 |
| 44459.666666666664 | 16.44 |
| 44459.677083333336 | 22.55 |
| 44459.6875 | 31.47 |
| 44459.697916666664 | 34.15 |
| 44459.708333333336 | 36.26 |
| 44459.71875 | 34.94 |
| 44459.729166666664 | 33.97 |
| 44459.739583333336 | 40.45 |
| 44459.75 | 37.7 |
| 44459.760416666664 | 32.44 |
| 44459.770833333336 | 32.56 |
| 44459.78125 | 27.06 |
| 44459.791666666664 | 24.83 |
| 44459.802083333336 | 24.54 |
| 44459.8125 | 22.39 |
| 44459.822916666664 | 20.26 |
| 44459.833333333336 | 19.12 |
| 44459.84375 | 20.21 |
| 44459.854166666664 | 18.51 |
| 44459.864583333336 | 17.29 |
| 44459.875 | 16.92 |
| 44459.885416666664 | 18.99 |
| 44459.895833333336 | 2840.04 |
| 44459.90625 | 18.3 |
| 44459.916666666664 | 18.6 |
| 44459.927083333336 | 17.11 |
| 44459.9375 | 18.14 |
| 44459.947916666664 | 17.96 |
| 44459.958333333336 | 17.42 |
| 44459.96875 | 17.85 |
| 44459.979166666664 | 13.7 |
| 44459.989583333336 | 12.55 |
| 44460.0 | 11.48 |
| 44460.010416666664 | 10.83 |
| 44460.020833333336 | 10.4 |
| 44460.03125 | 9.93 |
| 44460.041666666664 | 7.53 |
| 44460.052083333336 | 7.55 |
| 44460.0625 | 379.88 |
| 44460.072916666664 | 9.85 |
| 44460.083333333336 | 6.45 |
| 44460.09375 | 5.63 |
| 44460.104166666664 | 6.1 |
| 44460.114583333336 | 103.18 |
| 44460.125 | 7.25 |
| 44460.135416666664 | 10.93 |
| 44460.145833333336 | 11.74 |
| 44460.15625 | 13.58 |
| 44460.166666666664 | 14.33 |
| 44460.177083333336 | 16.96 |
| 44460.1875 | 14.81 |
| 44460.197916666664 | 16.06 |
| 44460.208333333336 | 18.62 |
| 44460.21875 | 21.4 |
| 44460.229166666664 | 23.99 |
| 44460.239583333336 | 27.71 |
| 44460.25 | 30.72 |
| 44460.260416666664 | 28.91 |
| 44460.270833333336 | 31.35 |
| 44460.28125 | 27.38 |
| 44460.291666666664 | 25.24 |
| 44460.302083333336 | 21.63 |
| 44460.3125 | 18.87 |
| 44460.322916666664 | 13.78 |
| 44460.333333333336 | 13.09 |
| 44460.34375 | 14.84 |
| 44460.354166666664 | 19.05 |
| 44460.364583333336 | 17.21 |
| 44460.375 | 17.2 |
| 44460.385416666664 | 16.64 |
| 44460.395833333336 | 16.25 |
| 44460.40625 | 15.89 |
| 44460.416666666664 | 14.18 |
| 44460.427083333336 | 15.9 |
| 44460.4375 | 15.72 |
| 44460.447916666664 | 16.6 |
| 44460.458333333336 | 15.74 |
| 44460.46875 | 14.81 |
| 44460.479166666664 | 14.37 |
| 44460.489583333336 | 13.97 |
| 44460.5 | 12.92 |
| 44460.510416666664 | 12.56 |
| 44460.520833333336 | 13.41 |
| 44460.53125 | 10.31 |
| 44460.541666666664 | 8.19 |
| 44460.552083333336 | 7.33 |
| 44460.5625 | 6.84 |
| 44460.572916666664 | 7.47 |
| 44460.583333333336 | 5.77 |
| 44460.59375 | 5.68 |
| 44460.604166666664 | 4.99 |
| 44460.614583333336 | 5.9 |
| 44460.625 | 7.17 |
| 44460.635416666664 | 9.61 |
| 44460.645833333336 | 10.51 |
| 44460.65625 | 13.22 |
| 44460.666666666664 | 13.92 |
| 44460.677083333336 | 13.49 |
| 44460.6875 | 16.1 |
| 44460.697916666664 | 17.38 |
| 44460.708333333336 | 30.06 |
| 44460.71875 | 25.25 |
| 44460.729166666664 | 32.82 |
| 44460.739583333336 | 33.34 |
| 44460.75 | 35.76 |
| 44460.760416666664 | 40.16 |
| 44460.770833333336 | 39.36 |
| 44460.78125 | 32.84 |
| 44460.791666666664 | 30.73 |
| 44460.802083333336 | 25.26 |
| 44460.8125 | 21.35 |
| 44460.822916666664 | 19.92 |
| 44460.833333333336 | 17.37 |
| 44460.84375 | 16.51 |
| 44460.854166666664 | 16.94 |
| 44460.864583333336 | 18.07 |
| 44460.875 | 18.43 |
| 44460.885416666664 | 19.05 |
| 44460.895833333336 | 20.27 |
| 44460.90625 | 20.23 |
| 44460.916666666664 | 21.07 |
| 44460.927083333336 | 17.74 |
| 44460.9375 | 17.97 |
| 44460.947916666664 | 19.9 |
| 44460.958333333336 | 19.02 |
| 44460.96875 | 17.63 |
| 44460.979166666664 | 15.86 |
| 44460.989583333336 | 14.2 |
| 44461.0 | 13.84 |
| 44461.010416666664 | 12.63 |
| 44461.020833333336 | 11.97 |
| 44461.03125 | 12.08 |
| 44461.041666666664 | 13.58 |
| 44461.052083333336 | 10.34 |
| 44461.0625 | 10.47 |
| 44461.072916666664 | 9.93 |
| 44461.083333333336 | 9.1 |
| 44461.09375 | 8.51 |
| 44461.104166666664 | 7.85 |
| 44461.114583333336 | 7.6 |
| 44461.125 | 6.91 |
| 44461.135416666664 | 7.9 |
| 44461.145833333336 | 6.66 |
| 44461.15625 | 9.75 |
| 44461.166666666664 | 11.69 |
| 44461.177083333336 | 12.32 |
| 44461.1875 | 13.55 |
| 44461.197916666664 | 15.25 |
| 44461.208333333336 | 16.27 |
| 44461.21875 | 19.48 |
| 44461.229166666664 | 21.96 |
| 44461.239583333336 | 18.15 |
| 44461.25 | 22.05 |
| 44461.260416666664 | 23.2 |
| 44461.270833333336 | 24.56 |
| 44461.28125 | 26.74 |
| 44461.291666666664 | 25.93 |
| 44461.302083333336 | 20.69 |
| 44461.3125 | 18.58 |
| 44461.322916666664 | 16.76 |
| 44461.333333333336 | 14.11 |
| 44461.34375 | 12.72 |
| 44461.354166666664 | 12.14 |
| 44461.364583333336 | 18.39 |
| 44461.375 | 15.74 |
| 44461.385416666664 | 15.31 |
| 44461.395833333336 | 16.68 |
| 44461.40625 | 13.82 |
| 44461.416666666664 | 16.12 |
| 44461.427083333336 | 13.61 |
| 44461.4375 | 15.19 |
| 44461.447916666664 | 16.62 |
| 44461.458333333336 | 18.5 |
| 44461.46875 | 17.41 |
| 44461.479166666664 | 16.49 |
| 44461.489583333336 | 16.91 |
| 44461.5 | 15.94 |
| 44461.510416666664 | 16.16 |
| 44461.520833333336 | 17.35 |
| 44461.53125 | 13.74 |
| 44461.541666666664 | 13.19 |
| 44461.552083333336 | 10.35 |
| 44461.5625 | 10.1 |
| 44461.572916666664 | 8.85 |
| 44461.583333333336 | 8.92 |
| 44461.59375 | 7.2 |
| 44461.604166666664 | 6.65 |
| 44461.614583333336 | 6.5 |
| 44461.625 | 5.7 |
| 44461.635416666664 | 5.85 |
| 44461.645833333336 | 6.85 |
| 44461.65625 | 8.95 |
| 44461.666666666664 | 9.23 |
| 44461.677083333336 | 11.15 |
| 44461.6875 | 13.91 |
| 44461.697916666664 | 14.91 |
| 44461.708333333336 | 16.22 |
| 44461.71875 | 18.35 |
| 44461.729166666664 | 20.84 |
| 44461.739583333336 | 22.21 |
| 44461.75 | 23.55 |
| 44461.760416666664 | 27.31 |
| 44461.770833333336 | 26.44 |
| 44461.78125 | 26.46 |
| 44461.791666666664 | 26.81 |
| 44461.802083333336 | 29.74 |
| 44461.8125 | 24.92 |
| 44461.822916666664 | 30.12 |
| 44461.833333333336 | 23.69 |
| 44461.84375 | 24.51 |
| 44461.854166666664 | 21.6 |
| 44461.864583333336 | 19.54 |
| 44461.875 | 19.69 |
| 44461.885416666664 | 22.01 |
| 44461.895833333336 | 20.87 |
| 44461.90625 | 21.77 |
| 44461.916666666664 | 25.5 |
| 44461.927083333336 | 26.67 |
| 44461.9375 | 30.76 |
| 44461.947916666664 | 35.12 |
| 44461.958333333336 | 34.34 |
| 44461.96875 | 32.3 |
| 44461.979166666664 | 30.65 |
| 44461.989583333336 | 29.42 |
| 44462.0 | 27.38 |
| 44462.010416666664 | 25.28 |
| 44462.020833333336 | 22.82 |
| 44462.03125 | 20.7 |
| 44462.041666666664 | 19.04 |
| 44462.052083333336 | 16.34 |
| 44462.0625 | 15.34 |
| 44462.072916666664 | 13.06 |
| 44462.083333333336 | 13.36 |
| 44462.09375 | 11.82 |
| 44462.104166666664 | 13.11 |
| 44462.114583333336 | 9.75 |
| 44462.125 | 10.5 |
| 44462.135416666664 | 8.74 |
| 44462.145833333336 | 10.3 |
| 44462.15625 | 10.09 |
| 44462.166666666664 | 8.23 |
| 44462.177083333336 | 9.2 |
| 44462.1875 | 11.22 |
| 44462.197916666664 | 14.28 |
| 44462.208333333336 | 16.9 |
| 44462.21875 | 20.12 |
| 44462.229166666664 | 18.99 |
| 44462.239583333336 | 21.98 |
| 44462.25 | 20.52 |
| 44462.260416666664 | 23.11 |
| 44462.270833333336 | 24.57 |
| 44462.28125 | 27.58 |
| 44462.291666666664 | 28.63 |
| 44462.302083333336 | 27.81 |
| 44462.3125 | 26.25 |
| 44462.322916666664 | 24.63 |
| 44462.333333333336 | 20.7 |
| 44462.34375 | 20.44 |
| 44462.354166666664 | 15.74 |
| 44462.364583333336 | 14.76 |
| 44462.375 | 19.94 |
| 44462.385416666664 | 19.49 |
| 44462.395833333336 | 18.56 |
| 44462.40625 | 19.59 |
| 44462.416666666664 | 23.58 |
| 44462.427083333336 | 29.02 |
| 44462.4375 | 36.33 |
| 44462.447916666664 | 39.19 |
| 44462.458333333336 | 41.85 |
| 44462.46875 | 41.14 |
| 44462.479166666664 | 41.42 |
| 44462.489583333336 | 41.53 |
| 44462.5 | 41.95 |
| 44462.510416666664 | 36.61 |
| 44462.520833333336 | 35.82 |
| 44462.53125 | 36.76 |
| 44462.541666666664 | 34 |
| 44462.552083333336 | 33.72 |
| 44462.5625 | 32.51 |
| 44462.572916666664 | 31.71 |
| 44462.583333333336 | 30.1 |
| 44462.59375 | 29.27 |
| 44462.604166666664 | 29.14 |
| 44462.614583333336 | 27.68 |
| 44462.625 | 24.56 |
| 44462.635416666664 | 22.31 |
| 44462.645833333336 | 19.29 |
| 44462.65625 | 16.08 |
| 44462.666666666664 | 14.88 |
| 44462.677083333336 | 14.97 |
| 44462.6875 | 16.22 |
| 44462.697916666664 | 15.31 |
| 44462.708333333336 | 20.7 |
| 44462.71875 | 35.77 |
| 44462.729166666664 | 31.35 |
| 44462.739583333336 | 40.03 |
| 44462.75 | 31.45 |
| 44462.760416666664 | 41.13 |
| 44462.770833333336 | 31.39 |
| 44462.78125 | 44.59 |
| 44462.791666666664 | 44.77 |
| 44462.802083333336 | 53.99 |
| 44462.8125 | 62.78 |
| 44462.822916666664 | 39.48 |
| 44462.833333333336 | 37.18 |
| 44462.84375 | 33.81 |
| 44462.854166666664 | 33.76 |
| 44462.864583333336 | 32.06 |
| 44462.875 | 31.08 |
| 44462.885416666664 | 27.75 |
| 44462.895833333336 | 20.6 |
| 44462.90625 | 28.81 |
| 44462.916666666664 | 26.54 |
| 44462.927083333336 | 25.47 |
| 44462.9375 | 25.17 |
| 44462.947916666664 | 25.99 |
| 44462.958333333336 | 25.02 |
| 44462.96875 | 24.43 |
| 44462.979166666664 | 22.55 |
| 44462.989583333336 | 20.63 |
| 44463.0 | 20.05 |
| 44463.010416666664 | 19.38 |
| 44463.020833333336 | 19.15 |
| 44463.03125 | 18.85 |
| 44463.041666666664 | 20.4 |
| 44463.052083333336 | 18.03 |
| 44463.0625 | 18.15 |
| 44463.072916666664 | 18.09 |
| 44463.083333333336 | 17.6 |
| 44463.09375 | 16.65 |
| 44463.104166666664 | 15.4 |
| 44463.114583333336 | 15.88 |
| 44463.125 | 14.7 |
| 44463.135416666664 | 15.28 |
| 44463.145833333336 | 13.35 |
| 44463.15625 | 11.86 |
| 44463.166666666664 | 11.13 |
| 44463.177083333336 | 10.18 |
| 44463.1875 | 11.61 |
| 44463.197916666664 | 11.82 |
| 44463.208333333336 | 14.46 |
| 44463.21875 | 14.77 |
| 44463.229166666664 | 14.87 |
| 44463.239583333336 | 25.3 |
| 44463.25 | 18.29 |
| 44463.260416666664 | 19.27 |
| 44463.270833333336 | 16.22 |
| 44463.28125 | 19.67 |
| 44463.291666666664 | 24.74 |
| 44463.302083333336 | 26.01 |
| 44463.3125 | 24.12 |
| 44463.322916666664 | 26.62 |
| 44463.333333333336 | 22.6 |
| 44463.34375 | 20.9 |
| 44463.354166666664 | 18.68 |
| 44463.364583333336 | 18.35 |
| 44463.375 | 15.31 |
| 44463.385416666664 | 12.52 |
| 44463.395833333336 | 12.79 |
| 44463.40625 | 17.22 |
| 44463.416666666664 | 15.06 |
| 44463.427083333336 | 14.55 |
| 44463.4375 | 15.25 |
| 44463.447916666664 | 16.12 |
| 44463.458333333336 | 16.8 |
| 44463.46875 | 19.15 |
| 44463.479166666664 | 19.13 |
| 44463.489583333336 | 19.64 |
| 44463.5 | 20.03 |
| 44463.510416666664 | 20.16 |
| 44463.520833333336 | 20.05 |
| 44463.53125 | 19.84 |
| 44463.541666666664 | 18.52 |
| 44463.552083333336 | 17.66 |
| 44463.5625 | 14.99 |
| 44463.572916666664 | 15.16 |
| 44463.583333333336 | 14.38 |
| 44463.59375 | 14.24 |
| 44463.604166666664 | 12.29 |
| 44463.614583333336 | 12.49 |
| 44463.625 | 11.17 |
| 44463.635416666664 | 9.15 |
| 44463.645833333336 | 8.45 |
| 44463.65625 | 8.25 |
| 44463.666666666664 | 6.84 |
| 44463.677083333336 | 6.27 |
| 44463.6875 | 6.68 |
| 44463.697916666664 | 8.23 |
| 44463.708333333336 | 8.87 |
| 44463.71875 | 10.44 |
| 44463.729166666664 | 10.95 |
| 44463.739583333336 | 12.6 |
| 44463.75 | 15.59 |
| 44463.760416666664 | 13.19 |
| 44463.770833333336 | 16.1 |
| 44463.78125 | 20.95 |
| 44463.791666666664 | 23.29 |
| 44463.802083333336 | 25.31 |
| 44463.8125 | 27.89 |
| 44463.822916666664 | 31.13 |
| 44463.833333333336 | 33.31 |
| 44463.84375 | 36.41 |
| 44463.854166666664 | 34.32 |
| 44463.864583333336 | 31.42 |
| 44463.875 | 31.68 |
| 44463.885416666664 | 29.88 |
| 44463.895833333336 | 24.77 |
| 44463.90625 | 21.54 |
| 44463.916666666664 | 15.7 |
| 44463.927083333336 | 13.85 |
| 44463.9375 | 17.67 |
| 44463.947916666664 | 17.66 |
| 44463.958333333336 | 20.43 |
| 44463.96875 | 20.43 |
| 44463.979166666664 | 18.72 |
| 44463.989583333336 | 18.34 |
| 44464.0 | 18.03 |
| 44464.010416666664 | 18.42 |
| 44464.020833333336 | 17.02 |
| 44464.03125 | 15.9 |
| 44464.041666666664 | 15.11 |
| 44464.052083333336 | 14.51 |
| 44464.0625 | 14.47 |
| 44464.072916666664 | 14.2 |
| 44464.083333333336 | 13.3 |
| 44464.09375 | 13.17 |
| 44464.104166666664 | 13.19 |
| 44464.114583333336 | 12.81 |
| 44464.125 | 12.92 |
| 44464.135416666664 | 13.24 |
| 44464.145833333336 | 11.7 |
| 44464.15625 | 11.93 |
| 44464.166666666664 | 10.5 |
| 44464.177083333336 | 10.93 |
| 44464.1875 | 9.38 |
| 44464.197916666664 | 9.26 |
| 44464.208333333336 | 9.04 |
| 44464.21875 | 8.57 |
| 44464.229166666664 | 11.3 |
| 44464.239583333336 | 12.02 |
| 44464.25 | 14.66 |
| 44464.260416666664 | 15.13 |
| 44464.270833333336 | 14.31 |
| 44464.28125 | 16.33 |
| 44464.291666666664 | 18.47 |
| 44464.302083333336 | 14.68 |
| 44464.3125 | 20.16 |
| 44464.322916666664 | 20.61 |
| 44464.333333333336 | 26.26 |
| 44464.34375 | 17.84 |
| 44464.354166666664 | 18.54 |
| 44464.364583333336 | 17.25 |
| 44464.375 | 14.35 |
| 44464.385416666664 | 13.69 |
| 44464.395833333336 | 12.13 |
| 44464.40625 | 11.79 |
| 44464.416666666664 | 10.72 |
| 44464.427083333336 | 15.19 |
| 44464.4375 | 17.01 |
| 44464.447916666664 | 15.68 |
| 44464.458333333336 | 14.46 |
| 44464.46875 | 14.89 |
| 44464.479166666664 | 15.78 |
| 44464.489583333336 | 16.25 |
| 44464.5 | 15.22 |
| 44464.510416666664 | 14.91 |
| 44464.520833333336 | 15.42 |
| 44464.53125 | 15.3 |
| 44464.541666666664 | 14.45 |
| 44464.552083333336 | 14.24 |
| 44464.5625 | 14.27 |
| 44464.572916666664 | 13.85 |
| 44464.583333333336 | 13.33 |
| 44464.59375 | 12.44 |
| 44464.604166666664 | 11.39 |
| 44464.614583333336 | 11.13 |
| 44464.625 | 9.42 |
| 44464.635416666664 | 9.36 |
| 44464.645833333336 | 8.07 |
| 44464.65625 | 8.09 |
| 44464.666666666664 | 6.64 |
| 44464.677083333336 | 6.32 |
| 44464.6875 | 5.36 |
| 44464.697916666664 | 5.28 |
| 44464.708333333336 | 5.11 |
| 44464.71875 | 5.7 |
| 44464.729166666664 | 7.01 |
| 44464.739583333336 | 8.77 |
| 44464.75 | 8.94 |
| 44464.760416666664 | 13.34 |
| 44464.770833333336 | 12.55 |
| 44464.78125 | 13.43 |
| 44464.791666666664 | 16.56 |
| 44464.802083333336 | 14.94 |
| 44464.8125 | 18.11 |
| 44464.822916666664 | 18.33 |
| 44464.833333333336 | 26.74 |
| 44464.84375 | 26.33 |
| 44464.854166666664 | 28.7 |
| 44464.864583333336 | 28.64 |
| 44464.875 | 30.82 |
| 44464.885416666664 | 27.83 |
| 44464.895833333336 | 24.98 |
| 44464.90625 | 22.96 |
| 44464.916666666664 | 20.69 |
| 44464.927083333336 | 16.11 |
| 44464.9375 | 12.94 |
| 44464.947916666664 | 13.4 |
| 44464.958333333336 | 16.26 |
| 44464.96875 | 14.95 |
| 44464.979166666664 | 17.4 |
| 44464.989583333336 | 16.37 |
| 44465.0 | 16.87 |
| 44465.010416666664 | 20.79 |
| 44465.020833333336 | 18.6 |
| 44465.03125 | 17.08 |
| 44465.041666666664 | 15.2 |
| 44465.052083333336 | 13.54 |
| 44465.0625 | 12.56 |
| 44465.072916666664 | 13.03 |
| 44465.083333333336 | 12.64 |
| 44465.09375 | 12.22 |
| 44465.104166666664 | 11.39 |
| 44465.114583333336 | 11.09 |
| 44465.125 | 10.89 |
| 44465.135416666664 | 10.05 |
| 44465.145833333336 | 9.43 |
| 44465.15625 | 9.87 |
| 44465.166666666664 | 11.2 |
| 44465.177083333336 | 9.48 |
| 44465.1875 | 9.18 |
| 44465.197916666664 | 7.74 |
| 44465.208333333336 | 8.8 |
| 44465.21875 | 8.3 |
| 44465.229166666664 | 7.5 |
| 44465.239583333336 | 8.34 |
| 44465.25 | 8.64 |
| 44465.260416666664 | 10.77 |
| 44465.270833333336 | 12.34 |
| 44465.28125 | 14.04 |
| 44465.291666666664 | 17.26 |
| 44465.302083333336 | 14.63 |
| 44465.3125 | 14.88 |
| 44465.322916666664 | 19.16 |
| 44465.333333333336 | 17.43 |
| 44465.34375 | 18.74 |
| 44465.354166666664 | 16.54 |
| 44465.364583333336 | 15.76 |
| 44465.375 | 14.48 |
| 44465.385416666664 | 13.52 |
| 44465.395833333336 | 15.14 |
| 44465.40625 | 11.74 |
| 44465.416666666664 | 11.63 |
| 44465.427083333336 | 11.26 |
| 44465.4375 | 9.39 |
| 44465.447916666664 | 11.48 |
| 44465.458333333336 | 13.11 |
| 44465.46875 | 14.91 |
| 44465.479166666664 | 13.79 |
| 44465.489583333336 | 13.43 |
| 44465.5 | 12.42 |
| 44465.510416666664 | 12.39 |
| 44465.520833333336 | 13.63 |
| 44465.53125 | 14.05 |
| 44465.541666666664 | 14.12 |
| 44465.552083333336 | 13.25 |
| 44465.5625 | 13.31 |
| 44465.572916666664 | 12.09 |
| 44465.583333333336 | 11.33 |
| 44465.59375 | 11.97 |
| 44465.604166666664 | 11.51 |
| 44465.614583333336 | 10.4 |
| 44465.625 | 10.69 |
| 44465.635416666664 | 9.89 |
| 44465.645833333336 | 9.22 |
| 44465.65625 | 8.7 |
| 44465.666666666664 | 8.03 |
| 44465.677083333336 | 7.69 |
| 44465.6875 | 7.69 |
| 44465.697916666664 | 6.67 |
| 44465.708333333336 | 6.24 |
| 44465.71875 | 5.34 |
| 44465.729166666664 | 7.38 |
| 44465.739583333336 | 7.31 |
| 44465.75 | 7.08 |
| 44465.760416666664 | 9.34 |
| 44465.770833333336 | 9.05 |
| 44465.78125 | 9.88 |
| 44465.791666666664 | 11.08 |
| 44465.802083333336 | 11.29 |
| 44465.8125 | 12.94 |
| 44465.822916666664 | 15.53 |
| 44465.833333333336 | 15.69 |
| 44465.84375 | 20.11 |
| 44465.854166666664 | 20.05 |
| 44465.864583333336 | 19.92 |
| 44465.875 | 22.19 |
| 44465.885416666664 | 24.45 |
| 44465.895833333336 | 21.72 |
| 44465.90625 | 23.7 |
| 44465.916666666664 | 18.93 |
| 44465.927083333336 | 19.27 |
| 44465.9375 | 15.38 |
| 44465.947916666664 | 13.85 |
| 44465.958333333336 | 12.37 |
| 44465.96875 | 11.77 |
| 44465.979166666664 | 11.28 |
| 44465.989583333336 | 10.56 |
| 44466.0 | 12.05 |
| 44466.010416666664 | 14.73 |
| 44466.020833333336 | 16.7 |
| 44466.03125 | 15.89 |
| 44466.041666666664 | 15.27 |
| 44466.052083333336 | 16.62 |
| 44466.0625 | 14.84 |
| 44466.072916666664 | 14.66 |
| 44466.083333333336 | 14.37 |
| 44466.09375 | 13.1 |
| 44466.104166666664 | 13.08 |
| 44466.114583333336 | 12.58 |
| 44466.125 | 15.07 |
| 44466.135416666664 | 11.39 |
| 44466.145833333336 | 11.66 |
| 44466.15625 | 10.58 |
| 44466.166666666664 | 10.56 |
| 44466.177083333336 | 10.33 |
| 44466.1875 | 9.06 |
| 44466.197916666664 | 10.2 |
| 44466.208333333336 | 9.74 |
| 44466.21875 | 9.43 |
| 44466.229166666664 | 7.96 |
| 44466.239583333336 | 7.78 |
| 44466.25 | 7.74 |
| 44466.260416666664 | 6.96 |
| 44466.270833333336 | 8.65 |
| 44466.28125 | 9.8 |
| 44466.291666666664 | 9.94 |
| 44466.302083333336 | 11.5 |
| 44466.3125 | 16.09 |
| 44466.322916666664 | 15.89 |
| 44466.333333333336 | 16.76 |
| 44466.34375 | 15.16 |
| 44466.354166666664 | 15.84 |
| 44466.364583333336 | 15.03 |
| 44466.375 | 15.06 |
| 44466.385416666664 | 13.19 |
| 44466.395833333336 | 12.22 |
| 44466.40625 | 14.38 |
| 44466.416666666664 | 11.85 |
| 44466.427083333336 | 10.66 |
| 44466.4375 | 11.15 |
| 44466.447916666664 | 10.74 |
| 44466.458333333336 | 11.13 |
| 44466.46875 | 10.13 |
| 44466.479166666664 | 9.77 |
| 44466.489583333336 | 10.9 |
| 44466.5 | 11.64 |
| 44466.510416666664 | 14.51 |
| 44466.520833333336 | 12.17 |
| 44466.53125 | 13.22 |
| 44466.541666666664 | 12.48 |
| 44466.552083333336 | 13.14 |
| 44466.5625 | 12.44 |
| 44466.572916666664 | 12.57 |
| 44466.583333333336 | 11.36 |
| 44466.59375 | 10.96 |
| 44466.604166666664 | 11.26 |
| 44466.614583333336 | 10.36 |
| 44466.625 | 10.87 |
| 44466.635416666664 | 9.65 |
| 44466.645833333336 | 8.93 |
| 44466.65625 | 9 |
| 44466.666666666664 | 9.33 |
| 44466.677083333336 | 8.59 |
| 44466.6875 | 7.24 |
| 44466.697916666664 | 6.29 |
| 44466.708333333336 | 6.09 |
| 44466.71875 | 5.34 |
| 44466.729166666664 | 4.93 |
| 44466.739583333336 | 4.76 |
| 44466.75 | 4.64 |
| 44466.760416666664 | 4.58 |
| 44466.770833333336 | 5.46 |
| 44466.78125 | 6.17 |
| 44466.791666666664 | 7.38 |
| 44466.802083333336 | 8.58 |
| 44466.8125 | 11.24 |
| 44466.822916666664 | 13.15 |
| 44466.833333333336 | 13.69 |
| 44466.84375 | 14.43 |
| 44466.854166666664 | 15.11 |
| 44466.864583333336 | 14.69 |
| 44466.875 | 14.9 |
| 44466.885416666664 | 14.86 |
| 44466.895833333336 | 14.38 |
| 44466.90625 | 13.89 |
| 44466.916666666664 | 14.66 |
| 44466.927083333336 | 12.87 |
| 44466.9375 | 13.19 |
| 44466.947916666664 | 13.89 |
| 44466.958333333336 | 13.39 |
| 44466.96875 | 12.1 |
| 44466.979166666664 | 11.26 |
| 44466.989583333336 | 10.6 |
| 44467.0 | 10.01 |
| 44467.010416666664 | 10.1 |
| 44467.020833333336 | 10.06 |
| 44467.03125 | 9.52 |
| 44467.041666666664 | 12.88 |
| 44467.052083333336 | 14.18 |
| 44467.0625 | 13.9 |
| 44467.072916666664 | 12.16 |
| 44467.083333333336 | 13.1 |
| 44467.09375 | 13.16 |
| 44467.104166666664 | 14.03 |
| 44467.114583333336 | 14.99 |
| 44467.125 | 13.87 |
| 44467.135416666664 | 13.84 |
| 44467.145833333336 | 13.11 |
| 44467.15625 | 13.85 |
| 44467.166666666664 | 11.17 |
| 44467.177083333336 | 11.02 |
| 44467.1875 | 11.33 |
| 44467.197916666664 | 11.62 |
| 44467.208333333336 | 10.91 |
| 44467.21875 | 11.77 |
| 44467.229166666664 | 10.28 |
| 44467.239583333336 | 9.63 |
| 44467.25 | 9.44 |
| 44467.260416666664 | 7.7 |
| 44467.270833333336 | 8.7 |
| 44467.28125 | 7.99 |
| 44467.291666666664 | 7.23 |
| 44467.302083333336 | 9.02 |
| 44467.3125 | 12.09 |
| 44467.322916666664 | 13.68 |
| 44467.333333333336 | 14.41 |
| 44467.34375 | 13.62 |
| 44467.354166666664 | 12.8 |
| 44467.364583333336 | 12.6 |
| 44467.375 | 11.12 |
| 44467.385416666664 | 12.2 |
| 44467.395833333336 | 10.94 |
| 44467.40625 | 11.89 |
| 44467.416666666664 | 12.03 |
| 44467.427083333336 | 13.35 |
| 44467.4375 | 14 |
| 44467.447916666664 | 13.5 |
| 44467.458333333336 | 14.15 |
| 44467.46875 | 13.93 |
| 44467.479166666664 | 13.39 |
| 44467.489583333336 | 13.96 |
| 44467.5 | 13.44 |
| 44467.510416666664 | 11.5 |
| 44467.520833333336 | 14.09 |
| 44467.53125 | 14.26 |
| 44467.541666666664 | 14.7 |
| 44467.552083333336 | 14.91 |
| 44467.5625 | 14.31 |
| 44467.572916666664 | 13.94 |
| 44467.583333333336 | 14.12 |
| 44467.59375 | 13.22 |
| 44467.604166666664 | 12.97 |
| 44467.614583333336 | 12.86 |
| 44467.625 | 12.58 |
| 44467.635416666664 | 11.9 |
| 44467.645833333336 | 11.4 |
| 44467.65625 | 11.82 |
| 44467.666666666664 | 10.26 |
| 44467.677083333336 | 10.72 |
| 44467.6875 | 10.04 |
| 44467.697916666664 | 9.58 |
| 44467.708333333336 | 9.72 |
| 44467.71875 | 9.07 |
| 44467.729166666664 | 8.46 |
| 44467.739583333336 | 7.84 |
| 44467.75 | 7.22 |
| 44467.760416666664 | 5.54 |
| 44467.770833333336 | 4.76 |
| 44467.78125 | 5.38 |
| 44467.791666666664 | 7.35 |
| 44467.802083333336 | 9.33 |
| 44467.8125 | 7.06 |
| 44467.822916666664 | 8.68 |
| 44467.833333333336 | 10.1 |
| 44467.84375 | 9.84 |
| 44467.854166666664 | 11.69 |
| 44467.864583333336 | 13.26 |
| 44467.875 | 14.21 |
| 44467.885416666664 | 15.07 |
| 44467.895833333336 | 14.54 |
| 44467.90625 | 18.55 |
| 44467.916666666664 | 16.15 |
| 44467.927083333336 | 15.55 |
| 44467.9375 | 14.78 |
| 44467.947916666664 | 12.65 |
| 44467.958333333336 | 11.36 |
| 44467.96875 | 12.41 |
| 44467.979166666664 | 11.73 |
| 44467.989583333336 | 10.37 |
| 44468.0 | 10.31 |
| 44468.010416666664 | 9.95 |
| 44468.020833333336 | 9.76 |
| 44468.03125 | 9.54 |
| 44468.041666666664 | 9.68 |
| 44468.052083333336 | 8.84 |
| 44468.0625 | 11.94 |
| 44468.072916666664 | 13.38 |
| 44468.083333333336 | 13.72 |
| 44468.09375 | 14.95 |
| 44468.104166666664 | 15.05 |
| 44468.114583333336 | 13.29 |
| 44468.125 | 13.89 |
| 44468.135416666664 | 13.17 |
| 44468.145833333336 | 12.99 |
| 44468.15625 | 12.89 |
| 44468.166666666664 | 12.23 |
| 44468.177083333336 | 10.79 |
| 44468.1875 | 10.44 |
| 44468.197916666664 | 10.52 |
| 44468.208333333336 | 9.87 |
| 44468.21875 | 9.3 |
| 44468.229166666664 | 9.11 |
| 44468.239583333336 | 9.37 |
| 44468.25 | 10.12 |
| 44468.260416666664 | 8.92 |
| 44468.270833333336 | 9.43 |
| 44468.28125 | 9.19 |
| 44468.291666666664 | 8.5 |
| 44468.302083333336 | 6.38 |
| 44468.3125 | 8.02 |
| 44468.322916666664 | 8.22 |
| 44468.333333333336 | 8.18 |
| 44468.34375 | 8.97 |
| 44468.354166666664 | 9.89 |
| 44468.364583333336 | 11.18 |
| 44468.375 | 11.18 |
| 44468.385416666664 | 11.61 |
| 44468.395833333336 | 11.58 |
| 44468.40625 | 12.51 |
| 44468.416666666664 | 11.47 |
| 44468.427083333336 | 11.93 |
| 44468.4375 | 12.42 |
| 44468.447916666664 | 12.51 |
| 44468.458333333336 | 12.98 |
| 44468.46875 | 13.26 |
| 44468.479166666664 | 12.33 |
| 44468.489583333336 | 11.38 |
| 44468.5 | 11.64 |
| 44468.510416666664 | 11.44 |
| 44468.520833333336 | 10.91 |
| 44468.53125 | 10.28 |
| 44468.541666666664 | 9.9 |
| 44468.552083333336 | 9.21 |
| 44468.5625 | 10.86 |
| 44468.572916666664 | 11.46 |
| 44468.583333333336 | 11.51 |
| 44468.59375 | 12.15 |
| 44468.604166666664 | 11.34 |
| 44468.614583333336 | 11.7 |
| 44468.625 | 11.4 |
| 44468.635416666664 | 11.36 |
| 44468.645833333336 | 12.49 |
| 44468.65625 | 10.71 |
| 44468.666666666664 | 10.37 |
| 44468.677083333336 | 10.53 |
| 44468.6875 | 9.44 |
| 44468.697916666664 | 9.55 |
| 44468.708333333336 | 8.53 |
| 44468.71875 | 9.11 |
| 44468.729166666664 | 7.93 |
| 44468.739583333336 | 7.36 |
| 44468.75 | 8.27 |
| 44468.760416666664 | 6.96 |
| 44468.770833333336 | 6.8 |
| 44468.78125 | 6.57 |
| 44468.791666666664 | 5.84 |
| 44468.802083333336 | 5.43 |
| 44468.8125 | 5.43 |
| 44468.822916666664 | 6.67 |
| 44468.833333333336 | 6.64 |
| 44468.84375 | 6.01 |
| 44468.854166666664 | 5.98 |
| 44468.864583333336 | 7.22 |
| 44468.875 | 7.33 |
| 44468.885416666664 | 7.47 |
| 44468.895833333336 | 9.59 |
| 44468.90625 | 9.93 |
| 44468.916666666664 | 9.96 |
| 44468.927083333336 | 12.22 |
| 44468.9375 | 11.07 |
| 44468.947916666664 | 12.88 |
| 44468.958333333336 | 13.16 |
| 44468.96875 | 13.75 |
| 44468.979166666664 | 11.41 |
| 44468.989583333336 | 11.95 |
| 44469.0 | 11.45 |
| 44469.010416666664 | 11.8 |
| 44469.020833333336 | 11.51 |
| 44469.03125 | 10.82 |
| 44469.041666666664 | 10.6 |
| 44469.052083333336 | 9.62 |
| 44469.0625 | 9.33 |
| 44469.072916666664 | 9.2 |
| 44469.083333333336 | 9.73 |
| 44469.09375 | 7.22 |
| 44469.104166666664 | 8.13 |
| 44469.114583333336 | 10.75 |
| 44469.125 | 15.29 |
| 44469.135416666664 | 12.17 |
| 44469.145833333336 | 11.59 |
| 44469.15625 | 11.33 |
| 44469.166666666664 | 11.43 |
| 44469.177083333336 | 11 |
| 44469.1875 | 10.14 |
| 44469.197916666664 | 9.7 |
| 44469.208333333336 | 10.01 |
| 44469.21875 | 9.47 |
| 44469.229166666664 | 8.82 |
| 44469.239583333336 | 8.39 |
| 44469.25 | 8.88 |
| 44469.260416666664 | 9.39 |
| 44469.270833333336 | 8.91 |
| 44469.28125 | 8.69 |
| 44469.291666666664 | 8.09 |
| 44469.302083333336 | 8.64 |
| 44469.3125 | 8.99 |
| 44469.322916666664 | 7.81 |
| 44469.333333333336 | 9.85 |
| 44469.34375 | 7.5 |
| 44469.354166666664 | 6.91 |
| 44469.364583333336 | 5.15 |
| 44469.375 | 5.88 |
| 44469.385416666664 | 5.59 |
| 44469.395833333336 | 5.64 |
| 44469.40625 | 6.9 |
| 44469.416666666664 | 8.07 |
| 44469.427083333336 | 8.31 |
| 44469.4375 | 8.99 |
| 44469.447916666664 | 9.48 |
| 44469.458333333336 | 10.11 |
| 44469.46875 | 10.01 |
| 44469.479166666664 | 12.56 |
| 44469.489583333336 | 12.85 |
| 44469.5 | 12.85 |
| 44469.510416666664 | 13.48 |
| 44469.520833333336 | 13.84 |
| 44469.53125 | 12.96 |
| 44469.541666666664 | 13.46 |
| 44469.552083333336 | 12.65 |
| 44469.5625 | 11.07 |
| 44469.572916666664 | 9.99 |
| 44469.583333333336 | 10.24 |
| 44469.59375 | 11.61 |
| 44469.604166666664 | 11.88 |
| 44469.614583333336 | 11.63 |
| 44469.625 | 11.39 |
| 44469.635416666664 | 11.33 |
| 44469.645833333336 | 11.18 |
| 44469.65625 | 11.56 |
| 44469.666666666664 | 10.39 |
| 44469.677083333336 | 9.44 |
| 44469.6875 | 9.32 |
| 44469.697916666664 | 9.53 |
| 44469.708333333336 | 9.08 |
| 44469.71875 | 8.84 |
| 44469.729166666664 | 8.85 |
| 44469.739583333336 | 9.3 |
| 44469.75 | 7.65 |
| 44469.760416666664 | 8.85 |
| 44469.770833333336 | 7.8 |
| 44469.78125 | 8.26 |
| 44469.791666666664 | 6.98 |
| 44469.802083333336 | 7.72 |
| 44469.8125 | 6.16 |
| 44469.822916666664 | 5.07 |
| 44469.833333333336 | 5.15 |
| 44469.84375 | 4.11 |
| 44469.854166666664 | 4.87 |
| 44469.864583333336 | 4.07 |
| 44469.875 | 3.95 |
| 44469.885416666664 | 4.07 |
| 44469.895833333336 | 4.97 |
| 44469.90625 | 6.89 |
| 44469.916666666664 | 9.44 |
| 44469.927083333336 | 9.45 |
| 44469.9375 | 9.24 |
| 44469.947916666664 | 10.86 |
| 44469.958333333336 | 11.07 |
| 44469.96875 | 12.06 |
| 44469.979166666664 | 13.83 |
| 44469.989583333336 | 13.91 |
| 44470.0 | 13.12 |
| 44470.010416666664 | 10.93 |
| 44470.020833333336 | 11.25 |
| 44470.03125 | 11 |
| 44470.041666666664 | 10.57 |
| 44470.052083333336 | 10.83 |
| 44470.0625 | 11.03 |
| 44470.072916666664 | 11.99 |
| 44470.083333333336 | 11.36 |
| 44470.09375 | 10.68 |
| 44470.104166666664 | 10.61 |
| 44470.114583333336 | 10.28 |
| 44470.125 | 9.26 |
| 44470.135416666664 | 12.51 |
| 44470.145833333336 | 12.28 |
| 44470.15625 | 12.29 |